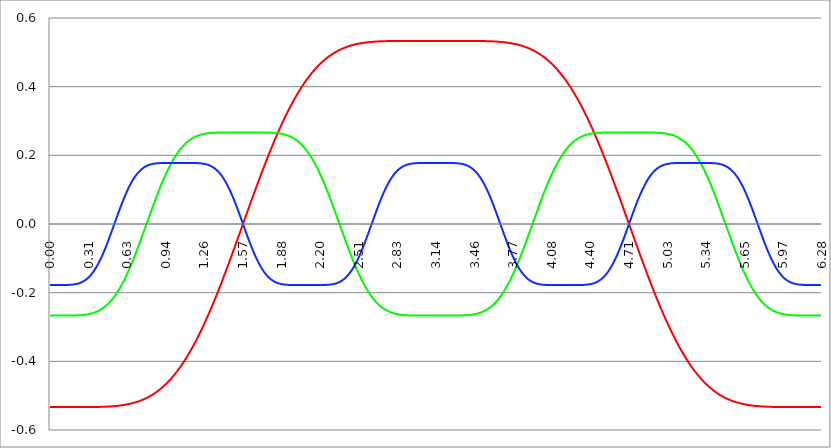
| Category | Series 1 | Series 0 | Series 2 |
|---|---|---|---|
| 0.0 | -0.533 | -0.267 | -0.178 |
| 0.00314159265358979 | -0.533 | -0.267 | -0.178 |
| 0.00628318530717958 | -0.533 | -0.267 | -0.178 |
| 0.00942477796076938 | -0.533 | -0.267 | -0.178 |
| 0.0125663706143592 | -0.533 | -0.267 | -0.178 |
| 0.015707963267949 | -0.533 | -0.267 | -0.178 |
| 0.0188495559215388 | -0.533 | -0.267 | -0.178 |
| 0.0219911485751285 | -0.533 | -0.267 | -0.178 |
| 0.0251327412287183 | -0.533 | -0.267 | -0.178 |
| 0.0282743338823081 | -0.533 | -0.267 | -0.178 |
| 0.0314159265358979 | -0.533 | -0.267 | -0.178 |
| 0.0345575191894877 | -0.533 | -0.267 | -0.178 |
| 0.0376991118430775 | -0.533 | -0.267 | -0.178 |
| 0.0408407044966673 | -0.533 | -0.267 | -0.178 |
| 0.0439822971502571 | -0.533 | -0.267 | -0.178 |
| 0.0471238898038469 | -0.533 | -0.267 | -0.178 |
| 0.0502654824574367 | -0.533 | -0.267 | -0.178 |
| 0.0534070751110265 | -0.533 | -0.267 | -0.178 |
| 0.0565486677646163 | -0.533 | -0.267 | -0.178 |
| 0.059690260418206 | -0.533 | -0.267 | -0.178 |
| 0.0628318530717958 | -0.533 | -0.267 | -0.178 |
| 0.0659734457253856 | -0.533 | -0.267 | -0.178 |
| 0.0691150383789754 | -0.533 | -0.267 | -0.178 |
| 0.0722566310325652 | -0.533 | -0.267 | -0.178 |
| 0.075398223686155 | -0.533 | -0.267 | -0.178 |
| 0.0785398163397448 | -0.533 | -0.267 | -0.178 |
| 0.0816814089933346 | -0.533 | -0.267 | -0.178 |
| 0.0848230016469244 | -0.533 | -0.267 | -0.178 |
| 0.0879645943005142 | -0.533 | -0.267 | -0.178 |
| 0.091106186954104 | -0.533 | -0.267 | -0.178 |
| 0.0942477796076937 | -0.533 | -0.267 | -0.178 |
| 0.0973893722612835 | -0.533 | -0.267 | -0.178 |
| 0.100530964914873 | -0.533 | -0.267 | -0.178 |
| 0.103672557568463 | -0.533 | -0.267 | -0.178 |
| 0.106814150222053 | -0.533 | -0.267 | -0.178 |
| 0.109955742875643 | -0.533 | -0.267 | -0.178 |
| 0.113097335529233 | -0.533 | -0.267 | -0.178 |
| 0.116238928182822 | -0.533 | -0.267 | -0.178 |
| 0.119380520836412 | -0.533 | -0.267 | -0.178 |
| 0.122522113490002 | -0.533 | -0.267 | -0.178 |
| 0.125663706143592 | -0.533 | -0.267 | -0.178 |
| 0.128805298797181 | -0.533 | -0.267 | -0.178 |
| 0.131946891450771 | -0.533 | -0.267 | -0.178 |
| 0.135088484104361 | -0.533 | -0.267 | -0.178 |
| 0.138230076757951 | -0.533 | -0.267 | -0.178 |
| 0.141371669411541 | -0.533 | -0.267 | -0.177 |
| 0.14451326206513 | -0.533 | -0.267 | -0.177 |
| 0.14765485471872 | -0.533 | -0.267 | -0.177 |
| 0.15079644737231 | -0.533 | -0.267 | -0.177 |
| 0.1539380400259 | -0.533 | -0.267 | -0.177 |
| 0.15707963267949 | -0.533 | -0.267 | -0.177 |
| 0.160221225333079 | -0.533 | -0.267 | -0.177 |
| 0.163362817986669 | -0.533 | -0.267 | -0.177 |
| 0.166504410640259 | -0.533 | -0.267 | -0.177 |
| 0.169646003293849 | -0.533 | -0.267 | -0.177 |
| 0.172787595947439 | -0.533 | -0.267 | -0.177 |
| 0.175929188601028 | -0.533 | -0.267 | -0.177 |
| 0.179070781254618 | -0.533 | -0.267 | -0.177 |
| 0.182212373908208 | -0.533 | -0.266 | -0.177 |
| 0.185353966561798 | -0.533 | -0.266 | -0.176 |
| 0.188495559215388 | -0.533 | -0.266 | -0.176 |
| 0.191637151868977 | -0.533 | -0.266 | -0.176 |
| 0.194778744522567 | -0.533 | -0.266 | -0.176 |
| 0.197920337176157 | -0.533 | -0.266 | -0.176 |
| 0.201061929829747 | -0.533 | -0.266 | -0.176 |
| 0.204203522483336 | -0.533 | -0.266 | -0.175 |
| 0.207345115136926 | -0.533 | -0.266 | -0.175 |
| 0.210486707790516 | -0.533 | -0.266 | -0.175 |
| 0.213628300444106 | -0.533 | -0.266 | -0.175 |
| 0.216769893097696 | -0.533 | -0.266 | -0.175 |
| 0.219911485751285 | -0.533 | -0.266 | -0.174 |
| 0.223053078404875 | -0.533 | -0.266 | -0.174 |
| 0.226194671058465 | -0.533 | -0.266 | -0.174 |
| 0.229336263712055 | -0.533 | -0.266 | -0.173 |
| 0.232477856365645 | -0.533 | -0.266 | -0.173 |
| 0.235619449019234 | -0.533 | -0.266 | -0.173 |
| 0.238761041672824 | -0.533 | -0.266 | -0.172 |
| 0.241902634326414 | -0.533 | -0.266 | -0.172 |
| 0.245044226980004 | -0.533 | -0.266 | -0.172 |
| 0.248185819633594 | -0.533 | -0.266 | -0.171 |
| 0.251327412287183 | -0.533 | -0.266 | -0.171 |
| 0.254469004940773 | -0.533 | -0.265 | -0.17 |
| 0.257610597594363 | -0.533 | -0.265 | -0.17 |
| 0.260752190247953 | -0.533 | -0.265 | -0.169 |
| 0.263893782901543 | -0.533 | -0.265 | -0.169 |
| 0.267035375555132 | -0.533 | -0.265 | -0.168 |
| 0.270176968208722 | -0.533 | -0.265 | -0.167 |
| 0.273318560862312 | -0.533 | -0.265 | -0.167 |
| 0.276460153515902 | -0.533 | -0.265 | -0.166 |
| 0.279601746169492 | -0.533 | -0.265 | -0.165 |
| 0.282743338823082 | -0.533 | -0.264 | -0.165 |
| 0.285884931476671 | -0.533 | -0.264 | -0.164 |
| 0.289026524130261 | -0.533 | -0.264 | -0.163 |
| 0.292168116783851 | -0.533 | -0.264 | -0.162 |
| 0.295309709437441 | -0.533 | -0.264 | -0.161 |
| 0.298451302091031 | -0.533 | -0.264 | -0.16 |
| 0.30159289474462 | -0.533 | -0.263 | -0.16 |
| 0.30473448739821 | -0.533 | -0.263 | -0.159 |
| 0.3078760800518 | -0.533 | -0.263 | -0.158 |
| 0.31101767270539 | -0.533 | -0.263 | -0.157 |
| 0.31415926535898 | -0.533 | -0.263 | -0.155 |
| 0.31730085801257 | -0.533 | -0.262 | -0.154 |
| 0.320442450666159 | -0.533 | -0.262 | -0.153 |
| 0.323584043319749 | -0.533 | -0.262 | -0.152 |
| 0.326725635973339 | -0.533 | -0.262 | -0.151 |
| 0.329867228626929 | -0.533 | -0.261 | -0.15 |
| 0.333008821280519 | -0.533 | -0.261 | -0.148 |
| 0.336150413934108 | -0.533 | -0.261 | -0.147 |
| 0.339292006587698 | -0.533 | -0.261 | -0.146 |
| 0.342433599241288 | -0.533 | -0.26 | -0.144 |
| 0.345575191894878 | -0.533 | -0.26 | -0.143 |
| 0.348716784548468 | -0.533 | -0.26 | -0.141 |
| 0.351858377202058 | -0.533 | -0.259 | -0.14 |
| 0.354999969855647 | -0.533 | -0.259 | -0.138 |
| 0.358141562509237 | -0.533 | -0.259 | -0.136 |
| 0.361283155162827 | -0.533 | -0.258 | -0.135 |
| 0.364424747816417 | -0.533 | -0.258 | -0.133 |
| 0.367566340470007 | -0.533 | -0.257 | -0.131 |
| 0.370707933123597 | -0.533 | -0.257 | -0.129 |
| 0.373849525777186 | -0.533 | -0.256 | -0.128 |
| 0.376991118430776 | -0.533 | -0.256 | -0.126 |
| 0.380132711084366 | -0.533 | -0.255 | -0.124 |
| 0.383274303737956 | -0.533 | -0.255 | -0.122 |
| 0.386415896391546 | -0.533 | -0.254 | -0.12 |
| 0.389557489045135 | -0.533 | -0.254 | -0.118 |
| 0.392699081698725 | -0.533 | -0.253 | -0.116 |
| 0.395840674352315 | -0.533 | -0.253 | -0.114 |
| 0.398982267005905 | -0.533 | -0.252 | -0.111 |
| 0.402123859659495 | -0.533 | -0.252 | -0.109 |
| 0.405265452313085 | -0.533 | -0.251 | -0.107 |
| 0.408407044966674 | -0.533 | -0.25 | -0.105 |
| 0.411548637620264 | -0.533 | -0.25 | -0.102 |
| 0.414690230273854 | -0.533 | -0.249 | -0.1 |
| 0.417831822927444 | -0.533 | -0.248 | -0.097 |
| 0.420973415581034 | -0.533 | -0.248 | -0.095 |
| 0.424115008234623 | -0.532 | -0.247 | -0.093 |
| 0.427256600888213 | -0.532 | -0.246 | -0.09 |
| 0.430398193541803 | -0.532 | -0.245 | -0.087 |
| 0.433539786195393 | -0.532 | -0.245 | -0.085 |
| 0.436681378848983 | -0.532 | -0.244 | -0.082 |
| 0.439822971502573 | -0.532 | -0.243 | -0.08 |
| 0.442964564156162 | -0.532 | -0.242 | -0.077 |
| 0.446106156809752 | -0.532 | -0.241 | -0.074 |
| 0.449247749463342 | -0.532 | -0.24 | -0.071 |
| 0.452389342116932 | -0.532 | -0.239 | -0.069 |
| 0.455530934770522 | -0.532 | -0.238 | -0.066 |
| 0.458672527424111 | -0.532 | -0.237 | -0.063 |
| 0.461814120077701 | -0.532 | -0.236 | -0.06 |
| 0.464955712731291 | -0.532 | -0.235 | -0.057 |
| 0.468097305384881 | -0.532 | -0.234 | -0.054 |
| 0.471238898038471 | -0.532 | -0.233 | -0.051 |
| 0.474380490692061 | -0.532 | -0.232 | -0.048 |
| 0.47752208334565 | -0.532 | -0.231 | -0.045 |
| 0.48066367599924 | -0.532 | -0.23 | -0.042 |
| 0.48380526865283 | -0.531 | -0.229 | -0.039 |
| 0.48694686130642 | -0.531 | -0.227 | -0.036 |
| 0.49008845396001 | -0.531 | -0.226 | -0.033 |
| 0.493230046613599 | -0.531 | -0.225 | -0.03 |
| 0.496371639267189 | -0.531 | -0.224 | -0.027 |
| 0.499513231920779 | -0.531 | -0.222 | -0.024 |
| 0.502654824574369 | -0.531 | -0.221 | -0.021 |
| 0.505796417227959 | -0.531 | -0.22 | -0.018 |
| 0.508938009881549 | -0.531 | -0.218 | -0.015 |
| 0.512079602535138 | -0.531 | -0.217 | -0.012 |
| 0.515221195188728 | -0.531 | -0.215 | -0.008 |
| 0.518362787842318 | -0.531 | -0.214 | -0.005 |
| 0.521504380495908 | -0.531 | -0.212 | -0.002 |
| 0.524645973149498 | -0.53 | -0.211 | 0.001 |
| 0.527787565803087 | -0.53 | -0.209 | 0.004 |
| 0.530929158456677 | -0.53 | -0.208 | 0.007 |
| 0.534070751110267 | -0.53 | -0.206 | 0.01 |
| 0.537212343763857 | -0.53 | -0.205 | 0.014 |
| 0.540353936417447 | -0.53 | -0.203 | 0.017 |
| 0.543495529071037 | -0.53 | -0.201 | 0.02 |
| 0.546637121724626 | -0.53 | -0.199 | 0.023 |
| 0.549778714378216 | -0.53 | -0.198 | 0.026 |
| 0.552920307031806 | -0.529 | -0.196 | 0.029 |
| 0.556061899685396 | -0.529 | -0.194 | 0.032 |
| 0.559203492338986 | -0.529 | -0.192 | 0.035 |
| 0.562345084992576 | -0.529 | -0.19 | 0.038 |
| 0.565486677646165 | -0.529 | -0.189 | 0.041 |
| 0.568628270299755 | -0.529 | -0.187 | 0.044 |
| 0.571769862953345 | -0.529 | -0.185 | 0.047 |
| 0.574911455606935 | -0.528 | -0.183 | 0.05 |
| 0.578053048260525 | -0.528 | -0.181 | 0.053 |
| 0.581194640914114 | -0.528 | -0.179 | 0.056 |
| 0.584336233567704 | -0.528 | -0.177 | 0.059 |
| 0.587477826221294 | -0.528 | -0.175 | 0.062 |
| 0.590619418874884 | -0.528 | -0.172 | 0.065 |
| 0.593761011528474 | -0.527 | -0.17 | 0.068 |
| 0.596902604182064 | -0.527 | -0.168 | 0.07 |
| 0.600044196835653 | -0.527 | -0.166 | 0.073 |
| 0.603185789489243 | -0.527 | -0.164 | 0.076 |
| 0.606327382142833 | -0.527 | -0.161 | 0.079 |
| 0.609468974796423 | -0.527 | -0.159 | 0.081 |
| 0.612610567450013 | -0.526 | -0.157 | 0.084 |
| 0.615752160103602 | -0.526 | -0.155 | 0.087 |
| 0.618893752757192 | -0.526 | -0.152 | 0.089 |
| 0.622035345410782 | -0.526 | -0.15 | 0.092 |
| 0.625176938064372 | -0.526 | -0.147 | 0.094 |
| 0.628318530717962 | -0.525 | -0.145 | 0.097 |
| 0.631460123371551 | -0.525 | -0.142 | 0.099 |
| 0.634601716025141 | -0.525 | -0.14 | 0.101 |
| 0.637743308678731 | -0.525 | -0.138 | 0.104 |
| 0.640884901332321 | -0.524 | -0.135 | 0.106 |
| 0.644026493985911 | -0.524 | -0.132 | 0.108 |
| 0.647168086639501 | -0.524 | -0.13 | 0.111 |
| 0.65030967929309 | -0.524 | -0.127 | 0.113 |
| 0.65345127194668 | -0.523 | -0.125 | 0.115 |
| 0.65659286460027 | -0.523 | -0.122 | 0.117 |
| 0.65973445725386 | -0.523 | -0.119 | 0.119 |
| 0.66287604990745 | -0.523 | -0.117 | 0.121 |
| 0.666017642561039 | -0.522 | -0.114 | 0.123 |
| 0.669159235214629 | -0.522 | -0.111 | 0.125 |
| 0.672300827868219 | -0.522 | -0.108 | 0.127 |
| 0.675442420521809 | -0.521 | -0.106 | 0.129 |
| 0.678584013175399 | -0.521 | -0.103 | 0.131 |
| 0.681725605828989 | -0.521 | -0.1 | 0.132 |
| 0.684867198482578 | -0.521 | -0.097 | 0.134 |
| 0.688008791136168 | -0.52 | -0.094 | 0.136 |
| 0.691150383789758 | -0.52 | -0.092 | 0.137 |
| 0.694291976443348 | -0.52 | -0.089 | 0.139 |
| 0.697433569096938 | -0.519 | -0.086 | 0.141 |
| 0.700575161750528 | -0.519 | -0.083 | 0.142 |
| 0.703716754404117 | -0.518 | -0.08 | 0.144 |
| 0.706858347057707 | -0.518 | -0.077 | 0.145 |
| 0.709999939711297 | -0.518 | -0.074 | 0.146 |
| 0.713141532364887 | -0.517 | -0.071 | 0.148 |
| 0.716283125018477 | -0.517 | -0.068 | 0.149 |
| 0.719424717672066 | -0.517 | -0.065 | 0.15 |
| 0.722566310325656 | -0.516 | -0.062 | 0.152 |
| 0.725707902979246 | -0.516 | -0.059 | 0.153 |
| 0.728849495632836 | -0.515 | -0.056 | 0.154 |
| 0.731991088286426 | -0.515 | -0.053 | 0.155 |
| 0.735132680940016 | -0.515 | -0.05 | 0.156 |
| 0.738274273593605 | -0.514 | -0.047 | 0.157 |
| 0.741415866247195 | -0.514 | -0.044 | 0.158 |
| 0.744557458900785 | -0.513 | -0.041 | 0.159 |
| 0.747699051554375 | -0.513 | -0.038 | 0.16 |
| 0.750840644207965 | -0.512 | -0.034 | 0.161 |
| 0.753982236861554 | -0.512 | -0.031 | 0.162 |
| 0.757123829515144 | -0.511 | -0.028 | 0.163 |
| 0.760265422168734 | -0.511 | -0.025 | 0.164 |
| 0.763407014822324 | -0.51 | -0.022 | 0.164 |
| 0.766548607475914 | -0.51 | -0.019 | 0.165 |
| 0.769690200129504 | -0.509 | -0.016 | 0.166 |
| 0.772831792783093 | -0.509 | -0.013 | 0.166 |
| 0.775973385436683 | -0.508 | -0.009 | 0.167 |
| 0.779114978090273 | -0.508 | -0.006 | 0.168 |
| 0.782256570743863 | -0.507 | -0.003 | 0.168 |
| 0.785398163397453 | -0.507 | 0 | 0.169 |
| 0.788539756051042 | -0.506 | 0.003 | 0.169 |
| 0.791681348704632 | -0.506 | 0.006 | 0.17 |
| 0.794822941358222 | -0.505 | 0.009 | 0.17 |
| 0.797964534011812 | -0.504 | 0.013 | 0.171 |
| 0.801106126665402 | -0.504 | 0.016 | 0.171 |
| 0.804247719318992 | -0.503 | 0.019 | 0.172 |
| 0.807389311972581 | -0.503 | 0.022 | 0.172 |
| 0.810530904626171 | -0.502 | 0.025 | 0.173 |
| 0.813672497279761 | -0.501 | 0.028 | 0.173 |
| 0.816814089933351 | -0.501 | 0.031 | 0.173 |
| 0.819955682586941 | -0.5 | 0.034 | 0.174 |
| 0.823097275240531 | -0.499 | 0.038 | 0.174 |
| 0.82623886789412 | -0.499 | 0.041 | 0.174 |
| 0.82938046054771 | -0.498 | 0.044 | 0.174 |
| 0.8325220532013 | -0.497 | 0.047 | 0.175 |
| 0.83566364585489 | -0.497 | 0.05 | 0.175 |
| 0.83880523850848 | -0.496 | 0.053 | 0.175 |
| 0.841946831162069 | -0.495 | 0.056 | 0.175 |
| 0.845088423815659 | -0.495 | 0.059 | 0.176 |
| 0.848230016469249 | -0.494 | 0.062 | 0.176 |
| 0.851371609122839 | -0.493 | 0.065 | 0.176 |
| 0.854513201776429 | -0.492 | 0.068 | 0.176 |
| 0.857654794430019 | -0.492 | 0.071 | 0.176 |
| 0.860796387083608 | -0.491 | 0.074 | 0.176 |
| 0.863937979737198 | -0.49 | 0.077 | 0.177 |
| 0.867079572390788 | -0.489 | 0.08 | 0.177 |
| 0.870221165044378 | -0.488 | 0.083 | 0.177 |
| 0.873362757697968 | -0.487 | 0.086 | 0.177 |
| 0.876504350351557 | -0.487 | 0.089 | 0.177 |
| 0.879645943005147 | -0.486 | 0.092 | 0.177 |
| 0.882787535658737 | -0.485 | 0.094 | 0.177 |
| 0.885929128312327 | -0.484 | 0.097 | 0.177 |
| 0.889070720965917 | -0.483 | 0.1 | 0.177 |
| 0.892212313619507 | -0.482 | 0.103 | 0.177 |
| 0.895353906273096 | -0.481 | 0.106 | 0.177 |
| 0.898495498926686 | -0.48 | 0.108 | 0.177 |
| 0.901637091580276 | -0.48 | 0.111 | 0.177 |
| 0.904778684233866 | -0.479 | 0.114 | 0.177 |
| 0.907920276887456 | -0.478 | 0.117 | 0.178 |
| 0.911061869541045 | -0.477 | 0.119 | 0.178 |
| 0.914203462194635 | -0.476 | 0.122 | 0.178 |
| 0.917345054848225 | -0.475 | 0.125 | 0.178 |
| 0.920486647501815 | -0.474 | 0.127 | 0.178 |
| 0.923628240155405 | -0.473 | 0.13 | 0.178 |
| 0.926769832808995 | -0.472 | 0.132 | 0.178 |
| 0.929911425462584 | -0.471 | 0.135 | 0.178 |
| 0.933053018116174 | -0.47 | 0.138 | 0.178 |
| 0.936194610769764 | -0.469 | 0.14 | 0.178 |
| 0.939336203423354 | -0.468 | 0.142 | 0.178 |
| 0.942477796076944 | -0.466 | 0.145 | 0.178 |
| 0.945619388730533 | -0.465 | 0.147 | 0.178 |
| 0.948760981384123 | -0.464 | 0.15 | 0.178 |
| 0.951902574037713 | -0.463 | 0.152 | 0.178 |
| 0.955044166691303 | -0.462 | 0.155 | 0.178 |
| 0.958185759344893 | -0.461 | 0.157 | 0.178 |
| 0.961327351998483 | -0.46 | 0.159 | 0.178 |
| 0.964468944652072 | -0.459 | 0.161 | 0.178 |
| 0.967610537305662 | -0.457 | 0.164 | 0.178 |
| 0.970752129959252 | -0.456 | 0.166 | 0.178 |
| 0.973893722612842 | -0.455 | 0.168 | 0.178 |
| 0.977035315266432 | -0.454 | 0.17 | 0.178 |
| 0.980176907920022 | -0.452 | 0.172 | 0.178 |
| 0.983318500573611 | -0.451 | 0.175 | 0.178 |
| 0.986460093227201 | -0.45 | 0.177 | 0.178 |
| 0.989601685880791 | -0.449 | 0.179 | 0.178 |
| 0.992743278534381 | -0.447 | 0.181 | 0.178 |
| 0.995884871187971 | -0.446 | 0.183 | 0.178 |
| 0.99902646384156 | -0.445 | 0.185 | 0.178 |
| 1.00216805649515 | -0.443 | 0.187 | 0.178 |
| 1.00530964914874 | -0.442 | 0.189 | 0.178 |
| 1.00845124180233 | -0.441 | 0.19 | 0.178 |
| 1.01159283445592 | -0.439 | 0.192 | 0.178 |
| 1.01473442710951 | -0.438 | 0.194 | 0.178 |
| 1.017876019763099 | -0.437 | 0.196 | 0.178 |
| 1.021017612416689 | -0.435 | 0.198 | 0.178 |
| 1.02415920507028 | -0.434 | 0.199 | 0.178 |
| 1.027300797723869 | -0.432 | 0.201 | 0.178 |
| 1.030442390377459 | -0.431 | 0.203 | 0.178 |
| 1.033583983031048 | -0.429 | 0.205 | 0.178 |
| 1.036725575684638 | -0.428 | 0.206 | 0.178 |
| 1.039867168338228 | -0.426 | 0.208 | 0.178 |
| 1.043008760991818 | -0.425 | 0.209 | 0.178 |
| 1.046150353645408 | -0.423 | 0.211 | 0.178 |
| 1.049291946298998 | -0.422 | 0.212 | 0.178 |
| 1.052433538952587 | -0.42 | 0.214 | 0.178 |
| 1.055575131606177 | -0.419 | 0.215 | 0.178 |
| 1.058716724259767 | -0.417 | 0.217 | 0.178 |
| 1.061858316913357 | -0.416 | 0.218 | 0.178 |
| 1.064999909566947 | -0.414 | 0.22 | 0.178 |
| 1.068141502220536 | -0.412 | 0.221 | 0.178 |
| 1.071283094874126 | -0.411 | 0.222 | 0.178 |
| 1.074424687527716 | -0.409 | 0.224 | 0.178 |
| 1.077566280181306 | -0.407 | 0.225 | 0.178 |
| 1.080707872834896 | -0.406 | 0.226 | 0.178 |
| 1.083849465488486 | -0.404 | 0.227 | 0.178 |
| 1.086991058142075 | -0.402 | 0.229 | 0.178 |
| 1.090132650795665 | -0.401 | 0.23 | 0.178 |
| 1.093274243449255 | -0.399 | 0.231 | 0.178 |
| 1.096415836102845 | -0.397 | 0.232 | 0.178 |
| 1.099557428756435 | -0.395 | 0.233 | 0.178 |
| 1.102699021410025 | -0.394 | 0.234 | 0.178 |
| 1.105840614063614 | -0.392 | 0.235 | 0.178 |
| 1.108982206717204 | -0.39 | 0.236 | 0.178 |
| 1.112123799370794 | -0.388 | 0.237 | 0.178 |
| 1.115265392024384 | -0.386 | 0.238 | 0.178 |
| 1.118406984677974 | -0.385 | 0.239 | 0.178 |
| 1.121548577331563 | -0.383 | 0.24 | 0.178 |
| 1.124690169985153 | -0.381 | 0.241 | 0.178 |
| 1.127831762638743 | -0.379 | 0.242 | 0.178 |
| 1.130973355292333 | -0.377 | 0.243 | 0.178 |
| 1.134114947945923 | -0.375 | 0.244 | 0.178 |
| 1.137256540599513 | -0.373 | 0.245 | 0.178 |
| 1.140398133253102 | -0.371 | 0.245 | 0.178 |
| 1.143539725906692 | -0.369 | 0.246 | 0.178 |
| 1.146681318560282 | -0.367 | 0.247 | 0.178 |
| 1.149822911213872 | -0.365 | 0.248 | 0.178 |
| 1.152964503867462 | -0.363 | 0.248 | 0.178 |
| 1.156106096521051 | -0.361 | 0.249 | 0.178 |
| 1.159247689174641 | -0.359 | 0.25 | 0.178 |
| 1.162389281828231 | -0.357 | 0.25 | 0.178 |
| 1.165530874481821 | -0.355 | 0.251 | 0.178 |
| 1.168672467135411 | -0.353 | 0.252 | 0.178 |
| 1.171814059789001 | -0.351 | 0.252 | 0.178 |
| 1.17495565244259 | -0.349 | 0.253 | 0.178 |
| 1.17809724509618 | -0.347 | 0.253 | 0.178 |
| 1.18123883774977 | -0.345 | 0.254 | 0.178 |
| 1.18438043040336 | -0.343 | 0.254 | 0.178 |
| 1.18752202305695 | -0.341 | 0.255 | 0.178 |
| 1.190663615710539 | -0.338 | 0.255 | 0.177 |
| 1.193805208364129 | -0.336 | 0.256 | 0.177 |
| 1.19694680101772 | -0.334 | 0.256 | 0.177 |
| 1.200088393671309 | -0.332 | 0.257 | 0.177 |
| 1.203229986324899 | -0.33 | 0.257 | 0.177 |
| 1.206371578978489 | -0.327 | 0.258 | 0.177 |
| 1.209513171632078 | -0.325 | 0.258 | 0.177 |
| 1.212654764285668 | -0.323 | 0.259 | 0.177 |
| 1.215796356939258 | -0.321 | 0.259 | 0.177 |
| 1.218937949592848 | -0.318 | 0.259 | 0.177 |
| 1.222079542246438 | -0.316 | 0.26 | 0.177 |
| 1.225221134900027 | -0.314 | 0.26 | 0.177 |
| 1.228362727553617 | -0.311 | 0.26 | 0.177 |
| 1.231504320207207 | -0.309 | 0.261 | 0.176 |
| 1.234645912860797 | -0.307 | 0.261 | 0.176 |
| 1.237787505514387 | -0.304 | 0.261 | 0.176 |
| 1.240929098167977 | -0.302 | 0.261 | 0.176 |
| 1.244070690821566 | -0.3 | 0.262 | 0.176 |
| 1.247212283475156 | -0.297 | 0.262 | 0.176 |
| 1.250353876128746 | -0.295 | 0.262 | 0.176 |
| 1.253495468782336 | -0.292 | 0.262 | 0.175 |
| 1.256637061435926 | -0.29 | 0.263 | 0.175 |
| 1.259778654089515 | -0.287 | 0.263 | 0.175 |
| 1.262920246743105 | -0.285 | 0.263 | 0.175 |
| 1.266061839396695 | -0.283 | 0.263 | 0.174 |
| 1.269203432050285 | -0.28 | 0.263 | 0.174 |
| 1.272345024703875 | -0.278 | 0.264 | 0.174 |
| 1.275486617357465 | -0.275 | 0.264 | 0.174 |
| 1.278628210011054 | -0.272 | 0.264 | 0.173 |
| 1.281769802664644 | -0.27 | 0.264 | 0.173 |
| 1.284911395318234 | -0.267 | 0.264 | 0.172 |
| 1.288052987971824 | -0.265 | 0.264 | 0.172 |
| 1.291194580625414 | -0.262 | 0.265 | 0.172 |
| 1.294336173279003 | -0.26 | 0.265 | 0.171 |
| 1.297477765932593 | -0.257 | 0.265 | 0.171 |
| 1.300619358586183 | -0.254 | 0.265 | 0.17 |
| 1.303760951239773 | -0.252 | 0.265 | 0.17 |
| 1.306902543893363 | -0.249 | 0.265 | 0.169 |
| 1.310044136546953 | -0.247 | 0.265 | 0.169 |
| 1.313185729200542 | -0.244 | 0.265 | 0.168 |
| 1.316327321854132 | -0.241 | 0.265 | 0.168 |
| 1.319468914507722 | -0.239 | 0.266 | 0.167 |
| 1.322610507161312 | -0.236 | 0.266 | 0.166 |
| 1.325752099814902 | -0.233 | 0.266 | 0.166 |
| 1.328893692468491 | -0.231 | 0.266 | 0.165 |
| 1.332035285122081 | -0.228 | 0.266 | 0.164 |
| 1.335176877775671 | -0.225 | 0.266 | 0.163 |
| 1.338318470429261 | -0.222 | 0.266 | 0.162 |
| 1.341460063082851 | -0.22 | 0.266 | 0.162 |
| 1.344601655736441 | -0.217 | 0.266 | 0.161 |
| 1.34774324839003 | -0.214 | 0.266 | 0.16 |
| 1.35088484104362 | -0.211 | 0.266 | 0.159 |
| 1.35402643369721 | -0.209 | 0.266 | 0.158 |
| 1.3571680263508 | -0.206 | 0.266 | 0.157 |
| 1.36030961900439 | -0.203 | 0.266 | 0.156 |
| 1.363451211657979 | -0.2 | 0.266 | 0.155 |
| 1.36659280431157 | -0.197 | 0.266 | 0.154 |
| 1.369734396965159 | -0.194 | 0.266 | 0.152 |
| 1.372875989618749 | -0.192 | 0.266 | 0.151 |
| 1.376017582272339 | -0.189 | 0.266 | 0.15 |
| 1.379159174925929 | -0.186 | 0.266 | 0.149 |
| 1.382300767579518 | -0.183 | 0.266 | 0.147 |
| 1.385442360233108 | -0.18 | 0.266 | 0.146 |
| 1.388583952886698 | -0.177 | 0.266 | 0.145 |
| 1.391725545540288 | -0.174 | 0.267 | 0.143 |
| 1.394867138193878 | -0.171 | 0.267 | 0.142 |
| 1.398008730847468 | -0.169 | 0.267 | 0.14 |
| 1.401150323501057 | -0.166 | 0.267 | 0.139 |
| 1.404291916154647 | -0.163 | 0.267 | 0.137 |
| 1.407433508808237 | -0.16 | 0.267 | 0.135 |
| 1.410575101461827 | -0.157 | 0.267 | 0.134 |
| 1.413716694115417 | -0.154 | 0.267 | 0.132 |
| 1.416858286769006 | -0.151 | 0.267 | 0.13 |
| 1.419999879422596 | -0.148 | 0.267 | 0.128 |
| 1.423141472076186 | -0.145 | 0.267 | 0.126 |
| 1.426283064729776 | -0.142 | 0.267 | 0.124 |
| 1.429424657383366 | -0.139 | 0.267 | 0.122 |
| 1.432566250036956 | -0.136 | 0.267 | 0.12 |
| 1.435707842690545 | -0.133 | 0.267 | 0.118 |
| 1.438849435344135 | -0.13 | 0.267 | 0.116 |
| 1.441991027997725 | -0.127 | 0.267 | 0.114 |
| 1.445132620651315 | -0.124 | 0.267 | 0.112 |
| 1.448274213304905 | -0.121 | 0.267 | 0.11 |
| 1.451415805958494 | -0.118 | 0.267 | 0.108 |
| 1.454557398612084 | -0.115 | 0.267 | 0.105 |
| 1.457698991265674 | -0.112 | 0.267 | 0.103 |
| 1.460840583919264 | -0.109 | 0.267 | 0.101 |
| 1.463982176572854 | -0.106 | 0.267 | 0.098 |
| 1.467123769226444 | -0.103 | 0.267 | 0.096 |
| 1.470265361880033 | -0.1 | 0.267 | 0.093 |
| 1.473406954533623 | -0.097 | 0.267 | 0.091 |
| 1.476548547187213 | -0.094 | 0.267 | 0.088 |
| 1.479690139840803 | -0.09 | 0.267 | 0.086 |
| 1.482831732494393 | -0.087 | 0.267 | 0.083 |
| 1.485973325147982 | -0.084 | 0.267 | 0.08 |
| 1.489114917801572 | -0.081 | 0.267 | 0.078 |
| 1.492256510455162 | -0.078 | 0.267 | 0.075 |
| 1.495398103108752 | -0.075 | 0.267 | 0.072 |
| 1.498539695762342 | -0.072 | 0.267 | 0.07 |
| 1.501681288415932 | -0.069 | 0.267 | 0.067 |
| 1.504822881069521 | -0.066 | 0.267 | 0.064 |
| 1.507964473723111 | -0.063 | 0.267 | 0.061 |
| 1.511106066376701 | -0.06 | 0.267 | 0.058 |
| 1.514247659030291 | -0.056 | 0.267 | 0.055 |
| 1.517389251683881 | -0.053 | 0.267 | 0.052 |
| 1.520530844337471 | -0.05 | 0.267 | 0.049 |
| 1.52367243699106 | -0.047 | 0.267 | 0.046 |
| 1.52681402964465 | -0.044 | 0.267 | 0.043 |
| 1.52995562229824 | -0.041 | 0.267 | 0.04 |
| 1.53309721495183 | -0.038 | 0.267 | 0.037 |
| 1.53623880760542 | -0.035 | 0.267 | 0.034 |
| 1.539380400259009 | -0.031 | 0.267 | 0.031 |
| 1.542521992912599 | -0.028 | 0.267 | 0.028 |
| 1.545663585566189 | -0.025 | 0.267 | 0.025 |
| 1.548805178219779 | -0.022 | 0.267 | 0.022 |
| 1.551946770873369 | -0.019 | 0.267 | 0.019 |
| 1.555088363526959 | -0.016 | 0.267 | 0.016 |
| 1.558229956180548 | -0.013 | 0.267 | 0.013 |
| 1.561371548834138 | -0.009 | 0.267 | 0.009 |
| 1.564513141487728 | -0.006 | 0.267 | 0.006 |
| 1.567654734141318 | -0.003 | 0.267 | 0.003 |
| 1.570796326794908 | 0 | 0.267 | 0 |
| 1.573937919448497 | 0.003 | 0.267 | -0.003 |
| 1.577079512102087 | 0.006 | 0.267 | -0.006 |
| 1.580221104755677 | 0.009 | 0.267 | -0.009 |
| 1.583362697409267 | 0.013 | 0.267 | -0.013 |
| 1.586504290062857 | 0.016 | 0.267 | -0.016 |
| 1.589645882716447 | 0.019 | 0.267 | -0.019 |
| 1.592787475370036 | 0.022 | 0.267 | -0.022 |
| 1.595929068023626 | 0.025 | 0.267 | -0.025 |
| 1.599070660677216 | 0.028 | 0.267 | -0.028 |
| 1.602212253330806 | 0.031 | 0.267 | -0.031 |
| 1.605353845984396 | 0.035 | 0.267 | -0.034 |
| 1.608495438637985 | 0.038 | 0.267 | -0.037 |
| 1.611637031291575 | 0.041 | 0.267 | -0.04 |
| 1.614778623945165 | 0.044 | 0.267 | -0.043 |
| 1.617920216598755 | 0.047 | 0.267 | -0.046 |
| 1.621061809252345 | 0.05 | 0.267 | -0.049 |
| 1.624203401905935 | 0.053 | 0.267 | -0.052 |
| 1.627344994559524 | 0.056 | 0.267 | -0.055 |
| 1.630486587213114 | 0.06 | 0.267 | -0.058 |
| 1.633628179866704 | 0.063 | 0.267 | -0.061 |
| 1.636769772520294 | 0.066 | 0.267 | -0.064 |
| 1.639911365173884 | 0.069 | 0.267 | -0.067 |
| 1.643052957827473 | 0.072 | 0.267 | -0.07 |
| 1.646194550481063 | 0.075 | 0.267 | -0.072 |
| 1.649336143134653 | 0.078 | 0.267 | -0.075 |
| 1.652477735788243 | 0.081 | 0.267 | -0.078 |
| 1.655619328441833 | 0.084 | 0.267 | -0.08 |
| 1.658760921095423 | 0.087 | 0.267 | -0.083 |
| 1.661902513749012 | 0.09 | 0.267 | -0.086 |
| 1.665044106402602 | 0.094 | 0.267 | -0.088 |
| 1.668185699056192 | 0.097 | 0.267 | -0.091 |
| 1.671327291709782 | 0.1 | 0.267 | -0.093 |
| 1.674468884363372 | 0.103 | 0.267 | -0.096 |
| 1.677610477016961 | 0.106 | 0.267 | -0.098 |
| 1.680752069670551 | 0.109 | 0.267 | -0.101 |
| 1.683893662324141 | 0.112 | 0.267 | -0.103 |
| 1.687035254977731 | 0.115 | 0.267 | -0.105 |
| 1.690176847631321 | 0.118 | 0.267 | -0.108 |
| 1.693318440284911 | 0.121 | 0.267 | -0.11 |
| 1.6964600329385 | 0.124 | 0.267 | -0.112 |
| 1.69960162559209 | 0.127 | 0.267 | -0.114 |
| 1.70274321824568 | 0.13 | 0.267 | -0.116 |
| 1.70588481089927 | 0.133 | 0.267 | -0.118 |
| 1.70902640355286 | 0.136 | 0.267 | -0.12 |
| 1.712167996206449 | 0.139 | 0.267 | -0.122 |
| 1.715309588860039 | 0.142 | 0.267 | -0.124 |
| 1.71845118151363 | 0.145 | 0.267 | -0.126 |
| 1.721592774167219 | 0.148 | 0.267 | -0.128 |
| 1.724734366820809 | 0.151 | 0.267 | -0.13 |
| 1.727875959474399 | 0.154 | 0.267 | -0.132 |
| 1.731017552127988 | 0.157 | 0.267 | -0.134 |
| 1.734159144781578 | 0.16 | 0.267 | -0.135 |
| 1.737300737435168 | 0.163 | 0.267 | -0.137 |
| 1.740442330088758 | 0.166 | 0.267 | -0.139 |
| 1.743583922742348 | 0.169 | 0.267 | -0.14 |
| 1.746725515395937 | 0.171 | 0.267 | -0.142 |
| 1.749867108049527 | 0.174 | 0.267 | -0.143 |
| 1.753008700703117 | 0.177 | 0.266 | -0.145 |
| 1.756150293356707 | 0.18 | 0.266 | -0.146 |
| 1.759291886010297 | 0.183 | 0.266 | -0.147 |
| 1.762433478663887 | 0.186 | 0.266 | -0.149 |
| 1.765575071317476 | 0.189 | 0.266 | -0.15 |
| 1.768716663971066 | 0.192 | 0.266 | -0.151 |
| 1.771858256624656 | 0.194 | 0.266 | -0.152 |
| 1.774999849278246 | 0.197 | 0.266 | -0.154 |
| 1.778141441931836 | 0.2 | 0.266 | -0.155 |
| 1.781283034585426 | 0.203 | 0.266 | -0.156 |
| 1.784424627239015 | 0.206 | 0.266 | -0.157 |
| 1.787566219892605 | 0.209 | 0.266 | -0.158 |
| 1.790707812546195 | 0.211 | 0.266 | -0.159 |
| 1.793849405199785 | 0.214 | 0.266 | -0.16 |
| 1.796990997853375 | 0.217 | 0.266 | -0.161 |
| 1.800132590506964 | 0.22 | 0.266 | -0.162 |
| 1.803274183160554 | 0.222 | 0.266 | -0.162 |
| 1.806415775814144 | 0.225 | 0.266 | -0.163 |
| 1.809557368467734 | 0.228 | 0.266 | -0.164 |
| 1.812698961121324 | 0.231 | 0.266 | -0.165 |
| 1.815840553774914 | 0.233 | 0.266 | -0.166 |
| 1.818982146428503 | 0.236 | 0.266 | -0.166 |
| 1.822123739082093 | 0.239 | 0.266 | -0.167 |
| 1.825265331735683 | 0.241 | 0.265 | -0.168 |
| 1.828406924389273 | 0.244 | 0.265 | -0.168 |
| 1.831548517042863 | 0.247 | 0.265 | -0.169 |
| 1.834690109696452 | 0.249 | 0.265 | -0.169 |
| 1.837831702350042 | 0.252 | 0.265 | -0.17 |
| 1.840973295003632 | 0.254 | 0.265 | -0.17 |
| 1.844114887657222 | 0.257 | 0.265 | -0.171 |
| 1.847256480310812 | 0.26 | 0.265 | -0.171 |
| 1.850398072964402 | 0.262 | 0.265 | -0.172 |
| 1.853539665617991 | 0.265 | 0.264 | -0.172 |
| 1.856681258271581 | 0.267 | 0.264 | -0.172 |
| 1.859822850925171 | 0.27 | 0.264 | -0.173 |
| 1.862964443578761 | 0.272 | 0.264 | -0.173 |
| 1.866106036232351 | 0.275 | 0.264 | -0.174 |
| 1.86924762888594 | 0.278 | 0.264 | -0.174 |
| 1.87238922153953 | 0.28 | 0.263 | -0.174 |
| 1.87553081419312 | 0.283 | 0.263 | -0.174 |
| 1.87867240684671 | 0.285 | 0.263 | -0.175 |
| 1.8818139995003 | 0.287 | 0.263 | -0.175 |
| 1.88495559215389 | 0.29 | 0.263 | -0.175 |
| 1.888097184807479 | 0.292 | 0.262 | -0.175 |
| 1.891238777461069 | 0.295 | 0.262 | -0.176 |
| 1.89438037011466 | 0.297 | 0.262 | -0.176 |
| 1.897521962768249 | 0.3 | 0.262 | -0.176 |
| 1.900663555421839 | 0.302 | 0.261 | -0.176 |
| 1.903805148075429 | 0.304 | 0.261 | -0.176 |
| 1.906946740729018 | 0.307 | 0.261 | -0.176 |
| 1.910088333382608 | 0.309 | 0.261 | -0.176 |
| 1.913229926036198 | 0.311 | 0.26 | -0.177 |
| 1.916371518689788 | 0.314 | 0.26 | -0.177 |
| 1.919513111343378 | 0.316 | 0.26 | -0.177 |
| 1.922654703996967 | 0.318 | 0.259 | -0.177 |
| 1.925796296650557 | 0.321 | 0.259 | -0.177 |
| 1.928937889304147 | 0.323 | 0.259 | -0.177 |
| 1.932079481957737 | 0.325 | 0.258 | -0.177 |
| 1.935221074611327 | 0.327 | 0.258 | -0.177 |
| 1.938362667264917 | 0.33 | 0.257 | -0.177 |
| 1.941504259918506 | 0.332 | 0.257 | -0.177 |
| 1.944645852572096 | 0.334 | 0.256 | -0.177 |
| 1.947787445225686 | 0.336 | 0.256 | -0.177 |
| 1.950929037879276 | 0.338 | 0.255 | -0.177 |
| 1.954070630532866 | 0.341 | 0.255 | -0.178 |
| 1.957212223186455 | 0.343 | 0.254 | -0.178 |
| 1.960353815840045 | 0.345 | 0.254 | -0.178 |
| 1.963495408493635 | 0.347 | 0.253 | -0.178 |
| 1.966637001147225 | 0.349 | 0.253 | -0.178 |
| 1.969778593800815 | 0.351 | 0.252 | -0.178 |
| 1.972920186454405 | 0.353 | 0.252 | -0.178 |
| 1.976061779107994 | 0.355 | 0.251 | -0.178 |
| 1.979203371761584 | 0.357 | 0.25 | -0.178 |
| 1.982344964415174 | 0.359 | 0.25 | -0.178 |
| 1.985486557068764 | 0.361 | 0.249 | -0.178 |
| 1.988628149722354 | 0.363 | 0.248 | -0.178 |
| 1.991769742375943 | 0.365 | 0.248 | -0.178 |
| 1.994911335029533 | 0.367 | 0.247 | -0.178 |
| 1.998052927683123 | 0.369 | 0.246 | -0.178 |
| 2.001194520336712 | 0.371 | 0.245 | -0.178 |
| 2.004336112990302 | 0.373 | 0.245 | -0.178 |
| 2.007477705643892 | 0.375 | 0.244 | -0.178 |
| 2.010619298297482 | 0.377 | 0.243 | -0.178 |
| 2.013760890951071 | 0.379 | 0.242 | -0.178 |
| 2.016902483604661 | 0.381 | 0.241 | -0.178 |
| 2.02004407625825 | 0.383 | 0.24 | -0.178 |
| 2.02318566891184 | 0.385 | 0.239 | -0.178 |
| 2.02632726156543 | 0.386 | 0.238 | -0.178 |
| 2.029468854219019 | 0.388 | 0.237 | -0.178 |
| 2.032610446872609 | 0.39 | 0.236 | -0.178 |
| 2.035752039526198 | 0.392 | 0.235 | -0.178 |
| 2.038893632179788 | 0.394 | 0.234 | -0.178 |
| 2.042035224833378 | 0.395 | 0.233 | -0.178 |
| 2.045176817486967 | 0.397 | 0.232 | -0.178 |
| 2.048318410140557 | 0.399 | 0.231 | -0.178 |
| 2.051460002794146 | 0.401 | 0.23 | -0.178 |
| 2.054601595447736 | 0.402 | 0.229 | -0.178 |
| 2.057743188101325 | 0.404 | 0.227 | -0.178 |
| 2.060884780754915 | 0.406 | 0.226 | -0.178 |
| 2.064026373408505 | 0.407 | 0.225 | -0.178 |
| 2.067167966062094 | 0.409 | 0.224 | -0.178 |
| 2.070309558715684 | 0.411 | 0.222 | -0.178 |
| 2.073451151369273 | 0.412 | 0.221 | -0.178 |
| 2.076592744022863 | 0.414 | 0.22 | -0.178 |
| 2.079734336676452 | 0.416 | 0.218 | -0.178 |
| 2.082875929330042 | 0.417 | 0.217 | -0.178 |
| 2.086017521983632 | 0.419 | 0.215 | -0.178 |
| 2.089159114637221 | 0.42 | 0.214 | -0.178 |
| 2.092300707290811 | 0.422 | 0.212 | -0.178 |
| 2.095442299944401 | 0.423 | 0.211 | -0.178 |
| 2.09858389259799 | 0.425 | 0.209 | -0.178 |
| 2.10172548525158 | 0.426 | 0.208 | -0.178 |
| 2.104867077905169 | 0.428 | 0.206 | -0.178 |
| 2.108008670558759 | 0.429 | 0.205 | -0.178 |
| 2.111150263212349 | 0.431 | 0.203 | -0.178 |
| 2.114291855865938 | 0.432 | 0.201 | -0.178 |
| 2.117433448519528 | 0.434 | 0.199 | -0.178 |
| 2.120575041173117 | 0.435 | 0.198 | -0.178 |
| 2.123716633826707 | 0.437 | 0.196 | -0.178 |
| 2.126858226480297 | 0.438 | 0.194 | -0.178 |
| 2.129999819133886 | 0.439 | 0.192 | -0.178 |
| 2.133141411787476 | 0.441 | 0.19 | -0.178 |
| 2.136283004441065 | 0.442 | 0.189 | -0.178 |
| 2.139424597094655 | 0.443 | 0.187 | -0.178 |
| 2.142566189748245 | 0.445 | 0.185 | -0.178 |
| 2.145707782401834 | 0.446 | 0.183 | -0.178 |
| 2.148849375055424 | 0.447 | 0.181 | -0.178 |
| 2.151990967709013 | 0.449 | 0.179 | -0.178 |
| 2.155132560362603 | 0.45 | 0.177 | -0.178 |
| 2.158274153016193 | 0.451 | 0.175 | -0.178 |
| 2.161415745669782 | 0.452 | 0.172 | -0.178 |
| 2.164557338323372 | 0.454 | 0.17 | -0.178 |
| 2.167698930976961 | 0.455 | 0.168 | -0.178 |
| 2.170840523630551 | 0.456 | 0.166 | -0.178 |
| 2.173982116284141 | 0.457 | 0.164 | -0.178 |
| 2.17712370893773 | 0.459 | 0.161 | -0.178 |
| 2.18026530159132 | 0.46 | 0.159 | -0.178 |
| 2.183406894244909 | 0.461 | 0.157 | -0.178 |
| 2.186548486898499 | 0.462 | 0.155 | -0.178 |
| 2.189690079552089 | 0.463 | 0.152 | -0.178 |
| 2.192831672205678 | 0.464 | 0.15 | -0.178 |
| 2.195973264859268 | 0.465 | 0.147 | -0.178 |
| 2.199114857512857 | 0.466 | 0.145 | -0.178 |
| 2.202256450166447 | 0.468 | 0.142 | -0.178 |
| 2.205398042820036 | 0.469 | 0.14 | -0.178 |
| 2.208539635473626 | 0.47 | 0.138 | -0.178 |
| 2.211681228127216 | 0.471 | 0.135 | -0.178 |
| 2.214822820780805 | 0.472 | 0.132 | -0.178 |
| 2.217964413434395 | 0.473 | 0.13 | -0.178 |
| 2.221106006087984 | 0.474 | 0.127 | -0.178 |
| 2.224247598741574 | 0.475 | 0.125 | -0.178 |
| 2.227389191395164 | 0.476 | 0.122 | -0.178 |
| 2.230530784048753 | 0.477 | 0.119 | -0.178 |
| 2.233672376702343 | 0.478 | 0.117 | -0.178 |
| 2.236813969355933 | 0.479 | 0.114 | -0.177 |
| 2.239955562009522 | 0.48 | 0.111 | -0.177 |
| 2.243097154663112 | 0.48 | 0.108 | -0.177 |
| 2.246238747316701 | 0.481 | 0.106 | -0.177 |
| 2.249380339970291 | 0.482 | 0.103 | -0.177 |
| 2.252521932623881 | 0.483 | 0.1 | -0.177 |
| 2.25566352527747 | 0.484 | 0.097 | -0.177 |
| 2.25880511793106 | 0.485 | 0.094 | -0.177 |
| 2.261946710584649 | 0.486 | 0.092 | -0.177 |
| 2.265088303238239 | 0.487 | 0.089 | -0.177 |
| 2.268229895891829 | 0.487 | 0.086 | -0.177 |
| 2.271371488545418 | 0.488 | 0.083 | -0.177 |
| 2.274513081199008 | 0.489 | 0.08 | -0.177 |
| 2.277654673852597 | 0.49 | 0.077 | -0.177 |
| 2.280796266506186 | 0.491 | 0.074 | -0.176 |
| 2.283937859159776 | 0.492 | 0.071 | -0.176 |
| 2.287079451813366 | 0.492 | 0.068 | -0.176 |
| 2.290221044466955 | 0.493 | 0.065 | -0.176 |
| 2.293362637120545 | 0.494 | 0.062 | -0.176 |
| 2.296504229774135 | 0.495 | 0.059 | -0.176 |
| 2.299645822427724 | 0.495 | 0.056 | -0.175 |
| 2.302787415081314 | 0.496 | 0.053 | -0.175 |
| 2.305929007734904 | 0.497 | 0.05 | -0.175 |
| 2.309070600388493 | 0.497 | 0.047 | -0.175 |
| 2.312212193042083 | 0.498 | 0.044 | -0.174 |
| 2.315353785695672 | 0.499 | 0.041 | -0.174 |
| 2.318495378349262 | 0.499 | 0.038 | -0.174 |
| 2.321636971002852 | 0.5 | 0.034 | -0.174 |
| 2.324778563656441 | 0.501 | 0.031 | -0.173 |
| 2.327920156310031 | 0.501 | 0.028 | -0.173 |
| 2.33106174896362 | 0.502 | 0.025 | -0.173 |
| 2.33420334161721 | 0.503 | 0.022 | -0.172 |
| 2.3373449342708 | 0.503 | 0.019 | -0.172 |
| 2.340486526924389 | 0.504 | 0.016 | -0.171 |
| 2.343628119577979 | 0.504 | 0.013 | -0.171 |
| 2.346769712231568 | 0.505 | 0.009 | -0.17 |
| 2.349911304885158 | 0.506 | 0.006 | -0.17 |
| 2.353052897538748 | 0.506 | 0.003 | -0.169 |
| 2.356194490192337 | 0.507 | 0 | -0.169 |
| 2.359336082845927 | 0.507 | -0.003 | -0.168 |
| 2.362477675499516 | 0.508 | -0.006 | -0.168 |
| 2.365619268153106 | 0.508 | -0.009 | -0.167 |
| 2.368760860806696 | 0.509 | -0.013 | -0.166 |
| 2.371902453460285 | 0.509 | -0.016 | -0.166 |
| 2.375044046113875 | 0.51 | -0.019 | -0.165 |
| 2.378185638767464 | 0.51 | -0.022 | -0.164 |
| 2.381327231421054 | 0.511 | -0.025 | -0.164 |
| 2.384468824074644 | 0.511 | -0.028 | -0.163 |
| 2.387610416728233 | 0.512 | -0.031 | -0.162 |
| 2.390752009381823 | 0.512 | -0.034 | -0.161 |
| 2.393893602035412 | 0.513 | -0.038 | -0.16 |
| 2.397035194689002 | 0.513 | -0.041 | -0.159 |
| 2.400176787342591 | 0.514 | -0.044 | -0.158 |
| 2.403318379996181 | 0.514 | -0.047 | -0.157 |
| 2.406459972649771 | 0.515 | -0.05 | -0.156 |
| 2.40960156530336 | 0.515 | -0.053 | -0.155 |
| 2.41274315795695 | 0.515 | -0.056 | -0.154 |
| 2.41588475061054 | 0.516 | -0.059 | -0.153 |
| 2.419026343264129 | 0.516 | -0.062 | -0.152 |
| 2.422167935917719 | 0.517 | -0.065 | -0.15 |
| 2.425309528571308 | 0.517 | -0.068 | -0.149 |
| 2.428451121224898 | 0.517 | -0.071 | -0.148 |
| 2.431592713878488 | 0.518 | -0.074 | -0.146 |
| 2.434734306532077 | 0.518 | -0.077 | -0.145 |
| 2.437875899185667 | 0.518 | -0.08 | -0.144 |
| 2.441017491839256 | 0.519 | -0.083 | -0.142 |
| 2.444159084492846 | 0.519 | -0.086 | -0.141 |
| 2.447300677146435 | 0.52 | -0.089 | -0.139 |
| 2.450442269800025 | 0.52 | -0.092 | -0.137 |
| 2.453583862453615 | 0.52 | -0.094 | -0.136 |
| 2.456725455107204 | 0.521 | -0.097 | -0.134 |
| 2.459867047760794 | 0.521 | -0.1 | -0.132 |
| 2.463008640414384 | 0.521 | -0.103 | -0.131 |
| 2.466150233067973 | 0.521 | -0.106 | -0.129 |
| 2.469291825721563 | 0.522 | -0.108 | -0.127 |
| 2.472433418375152 | 0.522 | -0.111 | -0.125 |
| 2.475575011028742 | 0.522 | -0.114 | -0.123 |
| 2.478716603682332 | 0.523 | -0.117 | -0.121 |
| 2.481858196335921 | 0.523 | -0.119 | -0.119 |
| 2.48499978898951 | 0.523 | -0.122 | -0.117 |
| 2.4881413816431 | 0.523 | -0.125 | -0.115 |
| 2.49128297429669 | 0.524 | -0.127 | -0.113 |
| 2.49442456695028 | 0.524 | -0.13 | -0.111 |
| 2.497566159603869 | 0.524 | -0.132 | -0.108 |
| 2.500707752257458 | 0.524 | -0.135 | -0.106 |
| 2.503849344911048 | 0.525 | -0.138 | -0.104 |
| 2.506990937564638 | 0.525 | -0.14 | -0.101 |
| 2.510132530218228 | 0.525 | -0.142 | -0.099 |
| 2.513274122871817 | 0.525 | -0.145 | -0.097 |
| 2.516415715525407 | 0.526 | -0.147 | -0.094 |
| 2.519557308178996 | 0.526 | -0.15 | -0.092 |
| 2.522698900832586 | 0.526 | -0.152 | -0.089 |
| 2.525840493486176 | 0.526 | -0.155 | -0.087 |
| 2.528982086139765 | 0.526 | -0.157 | -0.084 |
| 2.532123678793355 | 0.527 | -0.159 | -0.081 |
| 2.535265271446944 | 0.527 | -0.161 | -0.079 |
| 2.538406864100534 | 0.527 | -0.164 | -0.076 |
| 2.541548456754124 | 0.527 | -0.166 | -0.073 |
| 2.544690049407713 | 0.527 | -0.168 | -0.07 |
| 2.547831642061302 | 0.527 | -0.17 | -0.068 |
| 2.550973234714892 | 0.528 | -0.172 | -0.065 |
| 2.554114827368482 | 0.528 | -0.175 | -0.062 |
| 2.557256420022072 | 0.528 | -0.177 | -0.059 |
| 2.560398012675661 | 0.528 | -0.179 | -0.056 |
| 2.563539605329251 | 0.528 | -0.181 | -0.053 |
| 2.56668119798284 | 0.528 | -0.183 | -0.05 |
| 2.56982279063643 | 0.529 | -0.185 | -0.047 |
| 2.57296438329002 | 0.529 | -0.187 | -0.044 |
| 2.576105975943609 | 0.529 | -0.189 | -0.041 |
| 2.579247568597199 | 0.529 | -0.19 | -0.038 |
| 2.582389161250788 | 0.529 | -0.192 | -0.035 |
| 2.585530753904377 | 0.529 | -0.194 | -0.032 |
| 2.588672346557967 | 0.529 | -0.196 | -0.029 |
| 2.591813939211557 | 0.53 | -0.198 | -0.026 |
| 2.594955531865147 | 0.53 | -0.199 | -0.023 |
| 2.598097124518736 | 0.53 | -0.201 | -0.02 |
| 2.601238717172326 | 0.53 | -0.203 | -0.017 |
| 2.604380309825915 | 0.53 | -0.205 | -0.014 |
| 2.607521902479505 | 0.53 | -0.206 | -0.01 |
| 2.610663495133095 | 0.53 | -0.208 | -0.007 |
| 2.613805087786684 | 0.53 | -0.209 | -0.004 |
| 2.616946680440274 | 0.53 | -0.211 | -0.001 |
| 2.620088273093863 | 0.531 | -0.212 | 0.002 |
| 2.623229865747452 | 0.531 | -0.214 | 0.005 |
| 2.626371458401042 | 0.531 | -0.215 | 0.008 |
| 2.629513051054632 | 0.531 | -0.217 | 0.012 |
| 2.632654643708222 | 0.531 | -0.218 | 0.015 |
| 2.635796236361811 | 0.531 | -0.22 | 0.018 |
| 2.638937829015401 | 0.531 | -0.221 | 0.021 |
| 2.642079421668991 | 0.531 | -0.222 | 0.024 |
| 2.64522101432258 | 0.531 | -0.224 | 0.027 |
| 2.64836260697617 | 0.531 | -0.225 | 0.03 |
| 2.651504199629759 | 0.531 | -0.226 | 0.033 |
| 2.654645792283349 | 0.531 | -0.227 | 0.036 |
| 2.657787384936938 | 0.531 | -0.229 | 0.039 |
| 2.660928977590528 | 0.532 | -0.23 | 0.042 |
| 2.664070570244118 | 0.532 | -0.231 | 0.045 |
| 2.667212162897707 | 0.532 | -0.232 | 0.048 |
| 2.670353755551297 | 0.532 | -0.233 | 0.051 |
| 2.673495348204887 | 0.532 | -0.234 | 0.054 |
| 2.676636940858476 | 0.532 | -0.235 | 0.057 |
| 2.679778533512066 | 0.532 | -0.236 | 0.06 |
| 2.682920126165655 | 0.532 | -0.237 | 0.063 |
| 2.686061718819245 | 0.532 | -0.238 | 0.066 |
| 2.689203311472835 | 0.532 | -0.239 | 0.069 |
| 2.692344904126424 | 0.532 | -0.24 | 0.071 |
| 2.695486496780014 | 0.532 | -0.241 | 0.074 |
| 2.698628089433603 | 0.532 | -0.242 | 0.077 |
| 2.701769682087193 | 0.532 | -0.243 | 0.08 |
| 2.704911274740782 | 0.532 | -0.244 | 0.082 |
| 2.708052867394372 | 0.532 | -0.245 | 0.085 |
| 2.711194460047962 | 0.532 | -0.245 | 0.087 |
| 2.714336052701551 | 0.532 | -0.246 | 0.09 |
| 2.717477645355141 | 0.532 | -0.247 | 0.093 |
| 2.720619238008731 | 0.533 | -0.248 | 0.095 |
| 2.72376083066232 | 0.533 | -0.248 | 0.097 |
| 2.72690242331591 | 0.533 | -0.249 | 0.1 |
| 2.730044015969499 | 0.533 | -0.25 | 0.102 |
| 2.733185608623089 | 0.533 | -0.25 | 0.105 |
| 2.736327201276678 | 0.533 | -0.251 | 0.107 |
| 2.739468793930268 | 0.533 | -0.252 | 0.109 |
| 2.742610386583858 | 0.533 | -0.252 | 0.111 |
| 2.745751979237447 | 0.533 | -0.253 | 0.114 |
| 2.748893571891036 | 0.533 | -0.253 | 0.116 |
| 2.752035164544627 | 0.533 | -0.254 | 0.118 |
| 2.755176757198216 | 0.533 | -0.254 | 0.12 |
| 2.758318349851806 | 0.533 | -0.255 | 0.122 |
| 2.761459942505395 | 0.533 | -0.255 | 0.124 |
| 2.764601535158985 | 0.533 | -0.256 | 0.126 |
| 2.767743127812574 | 0.533 | -0.256 | 0.128 |
| 2.770884720466164 | 0.533 | -0.257 | 0.129 |
| 2.774026313119754 | 0.533 | -0.257 | 0.131 |
| 2.777167905773343 | 0.533 | -0.258 | 0.133 |
| 2.780309498426932 | 0.533 | -0.258 | 0.135 |
| 2.783451091080522 | 0.533 | -0.259 | 0.136 |
| 2.786592683734112 | 0.533 | -0.259 | 0.138 |
| 2.789734276387701 | 0.533 | -0.259 | 0.14 |
| 2.792875869041291 | 0.533 | -0.26 | 0.141 |
| 2.796017461694881 | 0.533 | -0.26 | 0.143 |
| 2.79915905434847 | 0.533 | -0.26 | 0.144 |
| 2.80230064700206 | 0.533 | -0.261 | 0.146 |
| 2.80544223965565 | 0.533 | -0.261 | 0.147 |
| 2.808583832309239 | 0.533 | -0.261 | 0.148 |
| 2.811725424962829 | 0.533 | -0.261 | 0.15 |
| 2.814867017616419 | 0.533 | -0.262 | 0.151 |
| 2.818008610270008 | 0.533 | -0.262 | 0.152 |
| 2.821150202923598 | 0.533 | -0.262 | 0.153 |
| 2.824291795577187 | 0.533 | -0.262 | 0.154 |
| 2.827433388230777 | 0.533 | -0.263 | 0.155 |
| 2.830574980884366 | 0.533 | -0.263 | 0.157 |
| 2.833716573537956 | 0.533 | -0.263 | 0.158 |
| 2.836858166191546 | 0.533 | -0.263 | 0.159 |
| 2.839999758845135 | 0.533 | -0.263 | 0.16 |
| 2.843141351498725 | 0.533 | -0.264 | 0.16 |
| 2.846282944152314 | 0.533 | -0.264 | 0.161 |
| 2.849424536805904 | 0.533 | -0.264 | 0.162 |
| 2.852566129459494 | 0.533 | -0.264 | 0.163 |
| 2.855707722113083 | 0.533 | -0.264 | 0.164 |
| 2.858849314766673 | 0.533 | -0.264 | 0.165 |
| 2.861990907420262 | 0.533 | -0.265 | 0.165 |
| 2.865132500073852 | 0.533 | -0.265 | 0.166 |
| 2.868274092727442 | 0.533 | -0.265 | 0.167 |
| 2.871415685381031 | 0.533 | -0.265 | 0.167 |
| 2.874557278034621 | 0.533 | -0.265 | 0.168 |
| 2.87769887068821 | 0.533 | -0.265 | 0.169 |
| 2.8808404633418 | 0.533 | -0.265 | 0.169 |
| 2.88398205599539 | 0.533 | -0.265 | 0.17 |
| 2.88712364864898 | 0.533 | -0.265 | 0.17 |
| 2.890265241302569 | 0.533 | -0.266 | 0.171 |
| 2.893406833956158 | 0.533 | -0.266 | 0.171 |
| 2.896548426609748 | 0.533 | -0.266 | 0.172 |
| 2.899690019263338 | 0.533 | -0.266 | 0.172 |
| 2.902831611916927 | 0.533 | -0.266 | 0.172 |
| 2.905973204570517 | 0.533 | -0.266 | 0.173 |
| 2.909114797224106 | 0.533 | -0.266 | 0.173 |
| 2.912256389877696 | 0.533 | -0.266 | 0.173 |
| 2.915397982531286 | 0.533 | -0.266 | 0.174 |
| 2.918539575184875 | 0.533 | -0.266 | 0.174 |
| 2.921681167838465 | 0.533 | -0.266 | 0.174 |
| 2.924822760492054 | 0.533 | -0.266 | 0.175 |
| 2.927964353145644 | 0.533 | -0.266 | 0.175 |
| 2.931105945799234 | 0.533 | -0.266 | 0.175 |
| 2.934247538452823 | 0.533 | -0.266 | 0.175 |
| 2.937389131106413 | 0.533 | -0.266 | 0.175 |
| 2.940530723760002 | 0.533 | -0.266 | 0.176 |
| 2.943672316413592 | 0.533 | -0.266 | 0.176 |
| 2.946813909067182 | 0.533 | -0.266 | 0.176 |
| 2.949955501720771 | 0.533 | -0.266 | 0.176 |
| 2.953097094374361 | 0.533 | -0.266 | 0.176 |
| 2.95623868702795 | 0.533 | -0.266 | 0.176 |
| 2.95938027968154 | 0.533 | -0.266 | 0.177 |
| 2.96252187233513 | 0.533 | -0.267 | 0.177 |
| 2.965663464988719 | 0.533 | -0.267 | 0.177 |
| 2.968805057642309 | 0.533 | -0.267 | 0.177 |
| 2.971946650295898 | 0.533 | -0.267 | 0.177 |
| 2.975088242949488 | 0.533 | -0.267 | 0.177 |
| 2.978229835603078 | 0.533 | -0.267 | 0.177 |
| 2.981371428256667 | 0.533 | -0.267 | 0.177 |
| 2.984513020910257 | 0.533 | -0.267 | 0.177 |
| 2.987654613563846 | 0.533 | -0.267 | 0.177 |
| 2.990796206217436 | 0.533 | -0.267 | 0.177 |
| 2.993937798871025 | 0.533 | -0.267 | 0.177 |
| 2.997079391524615 | 0.533 | -0.267 | 0.177 |
| 3.000220984178205 | 0.533 | -0.267 | 0.177 |
| 3.003362576831794 | 0.533 | -0.267 | 0.178 |
| 3.006504169485384 | 0.533 | -0.267 | 0.178 |
| 3.009645762138974 | 0.533 | -0.267 | 0.178 |
| 3.012787354792563 | 0.533 | -0.267 | 0.178 |
| 3.015928947446153 | 0.533 | -0.267 | 0.178 |
| 3.019070540099742 | 0.533 | -0.267 | 0.178 |
| 3.022212132753332 | 0.533 | -0.267 | 0.178 |
| 3.025353725406922 | 0.533 | -0.267 | 0.178 |
| 3.028495318060511 | 0.533 | -0.267 | 0.178 |
| 3.031636910714101 | 0.533 | -0.267 | 0.178 |
| 3.03477850336769 | 0.533 | -0.267 | 0.178 |
| 3.03792009602128 | 0.533 | -0.267 | 0.178 |
| 3.04106168867487 | 0.533 | -0.267 | 0.178 |
| 3.04420328132846 | 0.533 | -0.267 | 0.178 |
| 3.047344873982049 | 0.533 | -0.267 | 0.178 |
| 3.050486466635638 | 0.533 | -0.267 | 0.178 |
| 3.053628059289228 | 0.533 | -0.267 | 0.178 |
| 3.056769651942818 | 0.533 | -0.267 | 0.178 |
| 3.059911244596407 | 0.533 | -0.267 | 0.178 |
| 3.063052837249997 | 0.533 | -0.267 | 0.178 |
| 3.066194429903586 | 0.533 | -0.267 | 0.178 |
| 3.069336022557176 | 0.533 | -0.267 | 0.178 |
| 3.072477615210766 | 0.533 | -0.267 | 0.178 |
| 3.075619207864355 | 0.533 | -0.267 | 0.178 |
| 3.078760800517945 | 0.533 | -0.267 | 0.178 |
| 3.081902393171534 | 0.533 | -0.267 | 0.178 |
| 3.085043985825124 | 0.533 | -0.267 | 0.178 |
| 3.088185578478713 | 0.533 | -0.267 | 0.178 |
| 3.091327171132303 | 0.533 | -0.267 | 0.178 |
| 3.094468763785893 | 0.533 | -0.267 | 0.178 |
| 3.097610356439482 | 0.533 | -0.267 | 0.178 |
| 3.100751949093072 | 0.533 | -0.267 | 0.178 |
| 3.103893541746661 | 0.533 | -0.267 | 0.178 |
| 3.107035134400251 | 0.533 | -0.267 | 0.178 |
| 3.110176727053841 | 0.533 | -0.267 | 0.178 |
| 3.11331831970743 | 0.533 | -0.267 | 0.178 |
| 3.11645991236102 | 0.533 | -0.267 | 0.178 |
| 3.11960150501461 | 0.533 | -0.267 | 0.178 |
| 3.122743097668199 | 0.533 | -0.267 | 0.178 |
| 3.125884690321789 | 0.533 | -0.267 | 0.178 |
| 3.129026282975378 | 0.533 | -0.267 | 0.178 |
| 3.132167875628968 | 0.533 | -0.267 | 0.178 |
| 3.135309468282557 | 0.533 | -0.267 | 0.178 |
| 3.138451060936147 | 0.533 | -0.267 | 0.178 |
| 3.141592653589737 | 0.533 | -0.267 | 0.178 |
| 3.144734246243326 | 0.533 | -0.267 | 0.178 |
| 3.147875838896916 | 0.533 | -0.267 | 0.178 |
| 3.151017431550505 | 0.533 | -0.267 | 0.178 |
| 3.154159024204095 | 0.533 | -0.267 | 0.178 |
| 3.157300616857685 | 0.533 | -0.267 | 0.178 |
| 3.160442209511274 | 0.533 | -0.267 | 0.178 |
| 3.163583802164864 | 0.533 | -0.267 | 0.178 |
| 3.166725394818453 | 0.533 | -0.267 | 0.178 |
| 3.169866987472043 | 0.533 | -0.267 | 0.178 |
| 3.173008580125633 | 0.533 | -0.267 | 0.178 |
| 3.176150172779222 | 0.533 | -0.267 | 0.178 |
| 3.179291765432812 | 0.533 | -0.267 | 0.178 |
| 3.182433358086401 | 0.533 | -0.267 | 0.178 |
| 3.185574950739991 | 0.533 | -0.267 | 0.178 |
| 3.188716543393581 | 0.533 | -0.267 | 0.178 |
| 3.19185813604717 | 0.533 | -0.267 | 0.178 |
| 3.19499972870076 | 0.533 | -0.267 | 0.178 |
| 3.198141321354349 | 0.533 | -0.267 | 0.178 |
| 3.20128291400794 | 0.533 | -0.267 | 0.178 |
| 3.204424506661528 | 0.533 | -0.267 | 0.178 |
| 3.207566099315118 | 0.533 | -0.267 | 0.178 |
| 3.210707691968708 | 0.533 | -0.267 | 0.178 |
| 3.213849284622297 | 0.533 | -0.267 | 0.178 |
| 3.216990877275887 | 0.533 | -0.267 | 0.178 |
| 3.220132469929476 | 0.533 | -0.267 | 0.178 |
| 3.223274062583066 | 0.533 | -0.267 | 0.178 |
| 3.226415655236656 | 0.533 | -0.267 | 0.178 |
| 3.229557247890245 | 0.533 | -0.267 | 0.178 |
| 3.232698840543835 | 0.533 | -0.267 | 0.178 |
| 3.235840433197425 | 0.533 | -0.267 | 0.178 |
| 3.238982025851014 | 0.533 | -0.267 | 0.178 |
| 3.242123618504604 | 0.533 | -0.267 | 0.178 |
| 3.245265211158193 | 0.533 | -0.267 | 0.178 |
| 3.248406803811783 | 0.533 | -0.267 | 0.178 |
| 3.251548396465373 | 0.533 | -0.267 | 0.178 |
| 3.254689989118962 | 0.533 | -0.267 | 0.178 |
| 3.257831581772551 | 0.533 | -0.267 | 0.178 |
| 3.260973174426141 | 0.533 | -0.267 | 0.178 |
| 3.26411476707973 | 0.533 | -0.267 | 0.178 |
| 3.267256359733321 | 0.533 | -0.267 | 0.178 |
| 3.27039795238691 | 0.533 | -0.267 | 0.178 |
| 3.2735395450405 | 0.533 | -0.267 | 0.178 |
| 3.276681137694089 | 0.533 | -0.267 | 0.178 |
| 3.279822730347679 | 0.533 | -0.267 | 0.178 |
| 3.282964323001269 | 0.533 | -0.267 | 0.177 |
| 3.286105915654858 | 0.533 | -0.267 | 0.177 |
| 3.289247508308448 | 0.533 | -0.267 | 0.177 |
| 3.292389100962037 | 0.533 | -0.267 | 0.177 |
| 3.295530693615627 | 0.533 | -0.267 | 0.177 |
| 3.298672286269217 | 0.533 | -0.267 | 0.177 |
| 3.301813878922806 | 0.533 | -0.267 | 0.177 |
| 3.304955471576396 | 0.533 | -0.267 | 0.177 |
| 3.308097064229985 | 0.533 | -0.267 | 0.177 |
| 3.311238656883575 | 0.533 | -0.267 | 0.177 |
| 3.314380249537165 | 0.533 | -0.267 | 0.177 |
| 3.317521842190754 | 0.533 | -0.267 | 0.177 |
| 3.320663434844344 | 0.533 | -0.267 | 0.177 |
| 3.323805027497933 | 0.533 | -0.266 | 0.177 |
| 3.326946620151523 | 0.533 | -0.266 | 0.176 |
| 3.330088212805113 | 0.533 | -0.266 | 0.176 |
| 3.333229805458702 | 0.533 | -0.266 | 0.176 |
| 3.336371398112292 | 0.533 | -0.266 | 0.176 |
| 3.339512990765881 | 0.533 | -0.266 | 0.176 |
| 3.342654583419471 | 0.533 | -0.266 | 0.176 |
| 3.345796176073061 | 0.533 | -0.266 | 0.175 |
| 3.34893776872665 | 0.533 | -0.266 | 0.175 |
| 3.35207936138024 | 0.533 | -0.266 | 0.175 |
| 3.355220954033829 | 0.533 | -0.266 | 0.175 |
| 3.358362546687419 | 0.533 | -0.266 | 0.175 |
| 3.361504139341009 | 0.533 | -0.266 | 0.174 |
| 3.364645731994598 | 0.533 | -0.266 | 0.174 |
| 3.367787324648188 | 0.533 | -0.266 | 0.174 |
| 3.370928917301777 | 0.533 | -0.266 | 0.173 |
| 3.374070509955367 | 0.533 | -0.266 | 0.173 |
| 3.377212102608956 | 0.533 | -0.266 | 0.173 |
| 3.380353695262546 | 0.533 | -0.266 | 0.172 |
| 3.383495287916136 | 0.533 | -0.266 | 0.172 |
| 3.386636880569725 | 0.533 | -0.266 | 0.172 |
| 3.389778473223315 | 0.533 | -0.266 | 0.171 |
| 3.392920065876904 | 0.533 | -0.266 | 0.171 |
| 3.396061658530494 | 0.533 | -0.265 | 0.17 |
| 3.399203251184084 | 0.533 | -0.265 | 0.17 |
| 3.402344843837673 | 0.533 | -0.265 | 0.169 |
| 3.405486436491263 | 0.533 | -0.265 | 0.169 |
| 3.408628029144852 | 0.533 | -0.265 | 0.168 |
| 3.411769621798442 | 0.533 | -0.265 | 0.167 |
| 3.414911214452032 | 0.533 | -0.265 | 0.167 |
| 3.418052807105621 | 0.533 | -0.265 | 0.166 |
| 3.421194399759211 | 0.533 | -0.265 | 0.165 |
| 3.4243359924128 | 0.533 | -0.264 | 0.165 |
| 3.42747758506639 | 0.533 | -0.264 | 0.164 |
| 3.43061917771998 | 0.533 | -0.264 | 0.163 |
| 3.433760770373569 | 0.533 | -0.264 | 0.162 |
| 3.436902363027159 | 0.533 | -0.264 | 0.161 |
| 3.440043955680748 | 0.533 | -0.264 | 0.16 |
| 3.443185548334338 | 0.533 | -0.263 | 0.16 |
| 3.446327140987927 | 0.533 | -0.263 | 0.159 |
| 3.449468733641517 | 0.533 | -0.263 | 0.158 |
| 3.452610326295107 | 0.533 | -0.263 | 0.157 |
| 3.455751918948696 | 0.533 | -0.263 | 0.155 |
| 3.458893511602286 | 0.533 | -0.262 | 0.154 |
| 3.462035104255876 | 0.533 | -0.262 | 0.153 |
| 3.465176696909465 | 0.533 | -0.262 | 0.152 |
| 3.468318289563055 | 0.533 | -0.262 | 0.151 |
| 3.471459882216644 | 0.533 | -0.261 | 0.15 |
| 3.474601474870234 | 0.533 | -0.261 | 0.148 |
| 3.477743067523824 | 0.533 | -0.261 | 0.147 |
| 3.480884660177413 | 0.533 | -0.261 | 0.146 |
| 3.484026252831002 | 0.533 | -0.26 | 0.144 |
| 3.487167845484592 | 0.533 | -0.26 | 0.143 |
| 3.490309438138182 | 0.533 | -0.26 | 0.141 |
| 3.493451030791772 | 0.533 | -0.259 | 0.14 |
| 3.496592623445361 | 0.533 | -0.259 | 0.138 |
| 3.499734216098951 | 0.533 | -0.259 | 0.136 |
| 3.50287580875254 | 0.533 | -0.258 | 0.135 |
| 3.50601740140613 | 0.533 | -0.258 | 0.133 |
| 3.50915899405972 | 0.533 | -0.257 | 0.131 |
| 3.512300586713309 | 0.533 | -0.257 | 0.129 |
| 3.515442179366899 | 0.533 | -0.256 | 0.128 |
| 3.518583772020488 | 0.533 | -0.256 | 0.126 |
| 3.521725364674078 | 0.533 | -0.255 | 0.124 |
| 3.524866957327668 | 0.533 | -0.255 | 0.122 |
| 3.528008549981257 | 0.533 | -0.254 | 0.12 |
| 3.531150142634847 | 0.533 | -0.254 | 0.118 |
| 3.534291735288436 | 0.533 | -0.253 | 0.116 |
| 3.537433327942026 | 0.533 | -0.253 | 0.114 |
| 3.540574920595616 | 0.533 | -0.252 | 0.111 |
| 3.543716513249205 | 0.533 | -0.252 | 0.109 |
| 3.546858105902795 | 0.533 | -0.251 | 0.107 |
| 3.549999698556384 | 0.533 | -0.25 | 0.105 |
| 3.553141291209974 | 0.533 | -0.25 | 0.102 |
| 3.556282883863564 | 0.533 | -0.249 | 0.1 |
| 3.559424476517153 | 0.533 | -0.248 | 0.097 |
| 3.562566069170743 | 0.533 | -0.248 | 0.095 |
| 3.565707661824332 | 0.532 | -0.247 | 0.093 |
| 3.568849254477922 | 0.532 | -0.246 | 0.09 |
| 3.571990847131511 | 0.532 | -0.245 | 0.087 |
| 3.575132439785101 | 0.532 | -0.245 | 0.085 |
| 3.578274032438691 | 0.532 | -0.244 | 0.082 |
| 3.58141562509228 | 0.532 | -0.243 | 0.08 |
| 3.58455721774587 | 0.532 | -0.242 | 0.077 |
| 3.58769881039946 | 0.532 | -0.241 | 0.074 |
| 3.590840403053049 | 0.532 | -0.24 | 0.071 |
| 3.593981995706639 | 0.532 | -0.239 | 0.069 |
| 3.597123588360228 | 0.532 | -0.238 | 0.066 |
| 3.600265181013818 | 0.532 | -0.237 | 0.063 |
| 3.603406773667407 | 0.532 | -0.236 | 0.06 |
| 3.606548366320997 | 0.532 | -0.235 | 0.057 |
| 3.609689958974587 | 0.532 | -0.234 | 0.054 |
| 3.612831551628176 | 0.532 | -0.233 | 0.051 |
| 3.615973144281766 | 0.532 | -0.232 | 0.048 |
| 3.619114736935355 | 0.532 | -0.231 | 0.045 |
| 3.622256329588945 | 0.532 | -0.23 | 0.042 |
| 3.625397922242534 | 0.531 | -0.229 | 0.039 |
| 3.628539514896124 | 0.531 | -0.227 | 0.036 |
| 3.631681107549714 | 0.531 | -0.226 | 0.033 |
| 3.634822700203303 | 0.531 | -0.225 | 0.03 |
| 3.637964292856893 | 0.531 | -0.224 | 0.027 |
| 3.641105885510483 | 0.531 | -0.222 | 0.024 |
| 3.644247478164072 | 0.531 | -0.221 | 0.021 |
| 3.647389070817662 | 0.531 | -0.22 | 0.018 |
| 3.650530663471251 | 0.531 | -0.218 | 0.015 |
| 3.653672256124841 | 0.531 | -0.217 | 0.012 |
| 3.656813848778431 | 0.531 | -0.215 | 0.008 |
| 3.65995544143202 | 0.531 | -0.214 | 0.005 |
| 3.66309703408561 | 0.531 | -0.212 | 0.002 |
| 3.666238626739199 | 0.53 | -0.211 | -0.001 |
| 3.66938021939279 | 0.53 | -0.209 | -0.004 |
| 3.672521812046378 | 0.53 | -0.208 | -0.007 |
| 3.675663404699968 | 0.53 | -0.206 | -0.01 |
| 3.678804997353558 | 0.53 | -0.205 | -0.014 |
| 3.681946590007147 | 0.53 | -0.203 | -0.017 |
| 3.685088182660737 | 0.53 | -0.201 | -0.02 |
| 3.688229775314326 | 0.53 | -0.199 | -0.023 |
| 3.691371367967916 | 0.53 | -0.198 | -0.026 |
| 3.694512960621506 | 0.529 | -0.196 | -0.029 |
| 3.697654553275095 | 0.529 | -0.194 | -0.032 |
| 3.700796145928685 | 0.529 | -0.192 | -0.035 |
| 3.703937738582274 | 0.529 | -0.19 | -0.038 |
| 3.707079331235864 | 0.529 | -0.189 | -0.041 |
| 3.710220923889454 | 0.529 | -0.187 | -0.044 |
| 3.713362516543043 | 0.529 | -0.185 | -0.047 |
| 3.716504109196633 | 0.528 | -0.183 | -0.05 |
| 3.719645701850223 | 0.528 | -0.181 | -0.053 |
| 3.722787294503812 | 0.528 | -0.179 | -0.056 |
| 3.725928887157402 | 0.528 | -0.177 | -0.059 |
| 3.729070479810991 | 0.528 | -0.175 | -0.062 |
| 3.732212072464581 | 0.528 | -0.172 | -0.065 |
| 3.735353665118171 | 0.527 | -0.17 | -0.068 |
| 3.73849525777176 | 0.527 | -0.168 | -0.07 |
| 3.74163685042535 | 0.527 | -0.166 | -0.073 |
| 3.744778443078939 | 0.527 | -0.164 | -0.076 |
| 3.747920035732529 | 0.527 | -0.161 | -0.079 |
| 3.751061628386119 | 0.527 | -0.159 | -0.081 |
| 3.754203221039708 | 0.526 | -0.157 | -0.084 |
| 3.757344813693298 | 0.526 | -0.155 | -0.087 |
| 3.760486406346887 | 0.526 | -0.152 | -0.089 |
| 3.763627999000477 | 0.526 | -0.15 | -0.092 |
| 3.766769591654067 | 0.526 | -0.147 | -0.094 |
| 3.769911184307656 | 0.525 | -0.145 | -0.097 |
| 3.773052776961246 | 0.525 | -0.142 | -0.099 |
| 3.776194369614835 | 0.525 | -0.14 | -0.101 |
| 3.779335962268425 | 0.525 | -0.138 | -0.104 |
| 3.782477554922014 | 0.524 | -0.135 | -0.106 |
| 3.785619147575604 | 0.524 | -0.132 | -0.108 |
| 3.788760740229193 | 0.524 | -0.13 | -0.111 |
| 3.791902332882783 | 0.524 | -0.127 | -0.113 |
| 3.795043925536373 | 0.523 | -0.125 | -0.115 |
| 3.798185518189962 | 0.523 | -0.122 | -0.117 |
| 3.801327110843552 | 0.523 | -0.119 | -0.119 |
| 3.804468703497142 | 0.523 | -0.117 | -0.121 |
| 3.807610296150731 | 0.522 | -0.114 | -0.123 |
| 3.810751888804321 | 0.522 | -0.111 | -0.125 |
| 3.813893481457911 | 0.522 | -0.108 | -0.127 |
| 3.8170350741115 | 0.521 | -0.106 | -0.129 |
| 3.82017666676509 | 0.521 | -0.103 | -0.131 |
| 3.823318259418679 | 0.521 | -0.1 | -0.132 |
| 3.826459852072269 | 0.521 | -0.097 | -0.134 |
| 3.829601444725859 | 0.52 | -0.094 | -0.136 |
| 3.832743037379448 | 0.52 | -0.092 | -0.137 |
| 3.835884630033038 | 0.52 | -0.089 | -0.139 |
| 3.839026222686627 | 0.519 | -0.086 | -0.141 |
| 3.842167815340217 | 0.519 | -0.083 | -0.142 |
| 3.845309407993807 | 0.518 | -0.08 | -0.144 |
| 3.848451000647396 | 0.518 | -0.077 | -0.145 |
| 3.851592593300986 | 0.518 | -0.074 | -0.146 |
| 3.854734185954575 | 0.517 | -0.071 | -0.148 |
| 3.857875778608165 | 0.517 | -0.068 | -0.149 |
| 3.861017371261755 | 0.517 | -0.065 | -0.15 |
| 3.864158963915344 | 0.516 | -0.062 | -0.152 |
| 3.867300556568933 | 0.516 | -0.059 | -0.153 |
| 3.870442149222523 | 0.515 | -0.056 | -0.154 |
| 3.873583741876112 | 0.515 | -0.053 | -0.155 |
| 3.876725334529703 | 0.515 | -0.05 | -0.156 |
| 3.879866927183292 | 0.514 | -0.047 | -0.157 |
| 3.883008519836882 | 0.514 | -0.044 | -0.158 |
| 3.886150112490471 | 0.513 | -0.041 | -0.159 |
| 3.889291705144061 | 0.513 | -0.038 | -0.16 |
| 3.892433297797651 | 0.512 | -0.034 | -0.161 |
| 3.89557489045124 | 0.512 | -0.031 | -0.162 |
| 3.89871648310483 | 0.511 | -0.028 | -0.163 |
| 3.901858075758419 | 0.511 | -0.025 | -0.164 |
| 3.904999668412009 | 0.51 | -0.022 | -0.164 |
| 3.908141261065598 | 0.51 | -0.019 | -0.165 |
| 3.911282853719188 | 0.509 | -0.016 | -0.166 |
| 3.914424446372778 | 0.509 | -0.013 | -0.166 |
| 3.917566039026367 | 0.508 | -0.009 | -0.167 |
| 3.920707631679957 | 0.508 | -0.006 | -0.168 |
| 3.923849224333547 | 0.507 | -0.003 | -0.168 |
| 3.926990816987136 | 0.507 | 0 | -0.169 |
| 3.930132409640726 | 0.506 | 0.003 | -0.169 |
| 3.933274002294315 | 0.506 | 0.006 | -0.17 |
| 3.936415594947905 | 0.505 | 0.009 | -0.17 |
| 3.939557187601495 | 0.504 | 0.013 | -0.171 |
| 3.942698780255084 | 0.504 | 0.016 | -0.171 |
| 3.945840372908674 | 0.503 | 0.019 | -0.172 |
| 3.948981965562263 | 0.503 | 0.022 | -0.172 |
| 3.952123558215853 | 0.502 | 0.025 | -0.173 |
| 3.955265150869442 | 0.501 | 0.028 | -0.173 |
| 3.958406743523032 | 0.501 | 0.031 | -0.173 |
| 3.961548336176622 | 0.5 | 0.034 | -0.174 |
| 3.964689928830211 | 0.499 | 0.038 | -0.174 |
| 3.967831521483801 | 0.499 | 0.041 | -0.174 |
| 3.97097311413739 | 0.498 | 0.044 | -0.174 |
| 3.97411470679098 | 0.497 | 0.047 | -0.175 |
| 3.97725629944457 | 0.497 | 0.05 | -0.175 |
| 3.98039789209816 | 0.496 | 0.053 | -0.175 |
| 3.983539484751749 | 0.495 | 0.056 | -0.175 |
| 3.986681077405338 | 0.495 | 0.059 | -0.176 |
| 3.989822670058928 | 0.494 | 0.062 | -0.176 |
| 3.992964262712517 | 0.493 | 0.065 | -0.176 |
| 3.996105855366107 | 0.492 | 0.068 | -0.176 |
| 3.999247448019697 | 0.492 | 0.071 | -0.176 |
| 4.002389040673287 | 0.491 | 0.074 | -0.176 |
| 4.005530633326877 | 0.49 | 0.077 | -0.177 |
| 4.008672225980466 | 0.489 | 0.08 | -0.177 |
| 4.011813818634056 | 0.488 | 0.083 | -0.177 |
| 4.014955411287645 | 0.487 | 0.086 | -0.177 |
| 4.018097003941234 | 0.487 | 0.089 | -0.177 |
| 4.021238596594824 | 0.486 | 0.092 | -0.177 |
| 4.024380189248414 | 0.485 | 0.094 | -0.177 |
| 4.027521781902004 | 0.484 | 0.097 | -0.177 |
| 4.030663374555593 | 0.483 | 0.1 | -0.177 |
| 4.033804967209183 | 0.482 | 0.103 | -0.177 |
| 4.036946559862773 | 0.481 | 0.106 | -0.177 |
| 4.040088152516362 | 0.48 | 0.108 | -0.177 |
| 4.043229745169951 | 0.48 | 0.111 | -0.177 |
| 4.046371337823541 | 0.479 | 0.114 | -0.177 |
| 4.049512930477131 | 0.478 | 0.117 | -0.178 |
| 4.05265452313072 | 0.477 | 0.119 | -0.178 |
| 4.05579611578431 | 0.476 | 0.122 | -0.178 |
| 4.0589377084379 | 0.475 | 0.125 | -0.178 |
| 4.062079301091489 | 0.474 | 0.127 | -0.178 |
| 4.065220893745079 | 0.473 | 0.13 | -0.178 |
| 4.068362486398668 | 0.472 | 0.132 | -0.178 |
| 4.071504079052258 | 0.471 | 0.135 | -0.178 |
| 4.074645671705848 | 0.47 | 0.138 | -0.178 |
| 4.077787264359437 | 0.469 | 0.14 | -0.178 |
| 4.080928857013027 | 0.468 | 0.142 | -0.178 |
| 4.084070449666616 | 0.466 | 0.145 | -0.178 |
| 4.087212042320206 | 0.465 | 0.147 | -0.178 |
| 4.090353634973795 | 0.464 | 0.15 | -0.178 |
| 4.093495227627385 | 0.463 | 0.152 | -0.178 |
| 4.096636820280975 | 0.462 | 0.155 | -0.178 |
| 4.099778412934564 | 0.461 | 0.157 | -0.178 |
| 4.102920005588154 | 0.46 | 0.159 | -0.178 |
| 4.106061598241744 | 0.459 | 0.161 | -0.178 |
| 4.109203190895333 | 0.457 | 0.164 | -0.178 |
| 4.112344783548923 | 0.456 | 0.166 | -0.178 |
| 4.115486376202512 | 0.455 | 0.168 | -0.178 |
| 4.118627968856102 | 0.454 | 0.17 | -0.178 |
| 4.121769561509692 | 0.452 | 0.172 | -0.178 |
| 4.124911154163281 | 0.451 | 0.175 | -0.178 |
| 4.128052746816871 | 0.45 | 0.177 | -0.178 |
| 4.13119433947046 | 0.449 | 0.179 | -0.178 |
| 4.13433593212405 | 0.447 | 0.181 | -0.178 |
| 4.13747752477764 | 0.446 | 0.183 | -0.178 |
| 4.14061911743123 | 0.445 | 0.185 | -0.178 |
| 4.143760710084818 | 0.443 | 0.187 | -0.178 |
| 4.146902302738408 | 0.442 | 0.189 | -0.178 |
| 4.150043895391998 | 0.441 | 0.19 | -0.178 |
| 4.153185488045588 | 0.439 | 0.192 | -0.178 |
| 4.156327080699177 | 0.438 | 0.194 | -0.178 |
| 4.159468673352766 | 0.437 | 0.196 | -0.178 |
| 4.162610266006356 | 0.435 | 0.198 | -0.178 |
| 4.165751858659946 | 0.434 | 0.199 | -0.178 |
| 4.168893451313535 | 0.432 | 0.201 | -0.178 |
| 4.172035043967125 | 0.431 | 0.203 | -0.178 |
| 4.175176636620715 | 0.429 | 0.205 | -0.178 |
| 4.178318229274304 | 0.428 | 0.206 | -0.178 |
| 4.181459821927894 | 0.426 | 0.208 | -0.178 |
| 4.184601414581484 | 0.425 | 0.209 | -0.178 |
| 4.187743007235073 | 0.423 | 0.211 | -0.178 |
| 4.190884599888663 | 0.422 | 0.212 | -0.178 |
| 4.194026192542252 | 0.42 | 0.214 | -0.178 |
| 4.197167785195842 | 0.419 | 0.215 | -0.178 |
| 4.200309377849432 | 0.417 | 0.217 | -0.178 |
| 4.203450970503021 | 0.416 | 0.218 | -0.178 |
| 4.206592563156611 | 0.414 | 0.22 | -0.178 |
| 4.2097341558102 | 0.412 | 0.221 | -0.178 |
| 4.21287574846379 | 0.411 | 0.222 | -0.178 |
| 4.21601734111738 | 0.409 | 0.224 | -0.178 |
| 4.21915893377097 | 0.407 | 0.225 | -0.178 |
| 4.222300526424559 | 0.406 | 0.226 | -0.178 |
| 4.225442119078148 | 0.404 | 0.227 | -0.178 |
| 4.228583711731738 | 0.402 | 0.229 | -0.178 |
| 4.231725304385327 | 0.401 | 0.23 | -0.178 |
| 4.234866897038917 | 0.399 | 0.231 | -0.178 |
| 4.238008489692506 | 0.397 | 0.232 | -0.178 |
| 4.241150082346096 | 0.395 | 0.233 | -0.178 |
| 4.244291674999685 | 0.394 | 0.234 | -0.178 |
| 4.247433267653276 | 0.392 | 0.235 | -0.178 |
| 4.250574860306865 | 0.39 | 0.236 | -0.178 |
| 4.253716452960455 | 0.388 | 0.237 | -0.178 |
| 4.256858045614044 | 0.386 | 0.238 | -0.178 |
| 4.259999638267634 | 0.385 | 0.239 | -0.178 |
| 4.263141230921224 | 0.383 | 0.24 | -0.178 |
| 4.266282823574813 | 0.381 | 0.241 | -0.178 |
| 4.269424416228403 | 0.379 | 0.242 | -0.178 |
| 4.272566008881992 | 0.377 | 0.243 | -0.178 |
| 4.275707601535582 | 0.375 | 0.244 | -0.178 |
| 4.27884919418917 | 0.373 | 0.245 | -0.178 |
| 4.28199078684276 | 0.371 | 0.245 | -0.178 |
| 4.285132379496351 | 0.369 | 0.246 | -0.178 |
| 4.28827397214994 | 0.367 | 0.247 | -0.178 |
| 4.29141556480353 | 0.365 | 0.248 | -0.178 |
| 4.294557157457119 | 0.363 | 0.248 | -0.178 |
| 4.29769875011071 | 0.361 | 0.249 | -0.178 |
| 4.300840342764299 | 0.359 | 0.25 | -0.178 |
| 4.303981935417888 | 0.357 | 0.25 | -0.178 |
| 4.307123528071478 | 0.355 | 0.251 | -0.178 |
| 4.310265120725067 | 0.353 | 0.252 | -0.178 |
| 4.313406713378657 | 0.351 | 0.252 | -0.178 |
| 4.316548306032247 | 0.349 | 0.253 | -0.178 |
| 4.319689898685836 | 0.347 | 0.253 | -0.178 |
| 4.322831491339426 | 0.345 | 0.254 | -0.178 |
| 4.325973083993015 | 0.343 | 0.254 | -0.178 |
| 4.329114676646605 | 0.341 | 0.255 | -0.178 |
| 4.332256269300195 | 0.338 | 0.255 | -0.177 |
| 4.335397861953784 | 0.336 | 0.256 | -0.177 |
| 4.338539454607374 | 0.334 | 0.256 | -0.177 |
| 4.341681047260963 | 0.332 | 0.257 | -0.177 |
| 4.344822639914553 | 0.33 | 0.257 | -0.177 |
| 4.347964232568143 | 0.327 | 0.258 | -0.177 |
| 4.351105825221732 | 0.325 | 0.258 | -0.177 |
| 4.354247417875322 | 0.323 | 0.259 | -0.177 |
| 4.357389010528911 | 0.321 | 0.259 | -0.177 |
| 4.360530603182501 | 0.318 | 0.259 | -0.177 |
| 4.36367219583609 | 0.316 | 0.26 | -0.177 |
| 4.36681378848968 | 0.314 | 0.26 | -0.177 |
| 4.36995538114327 | 0.311 | 0.26 | -0.177 |
| 4.373096973796859 | 0.309 | 0.261 | -0.176 |
| 4.376238566450449 | 0.307 | 0.261 | -0.176 |
| 4.379380159104038 | 0.304 | 0.261 | -0.176 |
| 4.382521751757628 | 0.302 | 0.261 | -0.176 |
| 4.385663344411217 | 0.3 | 0.262 | -0.176 |
| 4.388804937064807 | 0.297 | 0.262 | -0.176 |
| 4.391946529718397 | 0.295 | 0.262 | -0.176 |
| 4.395088122371987 | 0.292 | 0.262 | -0.175 |
| 4.398229715025576 | 0.29 | 0.263 | -0.175 |
| 4.401371307679165 | 0.287 | 0.263 | -0.175 |
| 4.404512900332755 | 0.285 | 0.263 | -0.175 |
| 4.407654492986345 | 0.283 | 0.263 | -0.174 |
| 4.410796085639934 | 0.28 | 0.263 | -0.174 |
| 4.413937678293524 | 0.278 | 0.264 | -0.174 |
| 4.417079270947114 | 0.275 | 0.264 | -0.174 |
| 4.420220863600703 | 0.272 | 0.264 | -0.173 |
| 4.423362456254293 | 0.27 | 0.264 | -0.173 |
| 4.426504048907883 | 0.267 | 0.264 | -0.172 |
| 4.429645641561472 | 0.265 | 0.264 | -0.172 |
| 4.432787234215062 | 0.262 | 0.265 | -0.172 |
| 4.435928826868651 | 0.26 | 0.265 | -0.171 |
| 4.43907041952224 | 0.257 | 0.265 | -0.171 |
| 4.44221201217583 | 0.254 | 0.265 | -0.17 |
| 4.44535360482942 | 0.252 | 0.265 | -0.17 |
| 4.44849519748301 | 0.249 | 0.265 | -0.169 |
| 4.4516367901366 | 0.247 | 0.265 | -0.169 |
| 4.454778382790188 | 0.244 | 0.265 | -0.168 |
| 4.457919975443779 | 0.241 | 0.265 | -0.168 |
| 4.461061568097368 | 0.239 | 0.266 | -0.167 |
| 4.464203160750958 | 0.236 | 0.266 | -0.166 |
| 4.467344753404547 | 0.233 | 0.266 | -0.166 |
| 4.470486346058137 | 0.231 | 0.266 | -0.165 |
| 4.473627938711726 | 0.228 | 0.266 | -0.164 |
| 4.476769531365316 | 0.225 | 0.266 | -0.163 |
| 4.479911124018905 | 0.222 | 0.266 | -0.162 |
| 4.483052716672495 | 0.22 | 0.266 | -0.162 |
| 4.486194309326085 | 0.217 | 0.266 | -0.161 |
| 4.489335901979674 | 0.214 | 0.266 | -0.16 |
| 4.492477494633264 | 0.211 | 0.266 | -0.159 |
| 4.495619087286854 | 0.209 | 0.266 | -0.158 |
| 4.498760679940443 | 0.206 | 0.266 | -0.157 |
| 4.501902272594033 | 0.203 | 0.266 | -0.156 |
| 4.505043865247622 | 0.2 | 0.266 | -0.155 |
| 4.508185457901212 | 0.197 | 0.266 | -0.154 |
| 4.511327050554801 | 0.194 | 0.266 | -0.152 |
| 4.514468643208391 | 0.192 | 0.266 | -0.151 |
| 4.517610235861981 | 0.189 | 0.266 | -0.15 |
| 4.520751828515571 | 0.186 | 0.266 | -0.149 |
| 4.52389342116916 | 0.183 | 0.266 | -0.147 |
| 4.52703501382275 | 0.18 | 0.266 | -0.146 |
| 4.530176606476339 | 0.177 | 0.266 | -0.145 |
| 4.533318199129928 | 0.174 | 0.267 | -0.143 |
| 4.536459791783518 | 0.171 | 0.267 | -0.142 |
| 4.539601384437108 | 0.169 | 0.267 | -0.14 |
| 4.542742977090698 | 0.166 | 0.267 | -0.139 |
| 4.545884569744287 | 0.163 | 0.267 | -0.137 |
| 4.549026162397876 | 0.16 | 0.267 | -0.135 |
| 4.552167755051466 | 0.157 | 0.267 | -0.134 |
| 4.555309347705056 | 0.154 | 0.267 | -0.132 |
| 4.558450940358646 | 0.151 | 0.267 | -0.13 |
| 4.561592533012235 | 0.148 | 0.267 | -0.128 |
| 4.564734125665825 | 0.145 | 0.267 | -0.126 |
| 4.567875718319415 | 0.142 | 0.267 | -0.124 |
| 4.571017310973004 | 0.139 | 0.267 | -0.122 |
| 4.574158903626594 | 0.136 | 0.267 | -0.12 |
| 4.577300496280183 | 0.133 | 0.267 | -0.118 |
| 4.580442088933772 | 0.13 | 0.267 | -0.116 |
| 4.583583681587362 | 0.127 | 0.267 | -0.114 |
| 4.586725274240952 | 0.124 | 0.267 | -0.112 |
| 4.589866866894542 | 0.121 | 0.267 | -0.11 |
| 4.593008459548131 | 0.118 | 0.267 | -0.108 |
| 4.596150052201721 | 0.115 | 0.267 | -0.105 |
| 4.59929164485531 | 0.112 | 0.267 | -0.103 |
| 4.6024332375089 | 0.109 | 0.267 | -0.101 |
| 4.60557483016249 | 0.106 | 0.267 | -0.098 |
| 4.608716422816079 | 0.103 | 0.267 | -0.096 |
| 4.611858015469668 | 0.1 | 0.267 | -0.093 |
| 4.614999608123258 | 0.097 | 0.267 | -0.091 |
| 4.618141200776848 | 0.094 | 0.267 | -0.088 |
| 4.621282793430437 | 0.09 | 0.267 | -0.086 |
| 4.624424386084027 | 0.087 | 0.267 | -0.083 |
| 4.627565978737617 | 0.084 | 0.267 | -0.08 |
| 4.630707571391206 | 0.081 | 0.267 | -0.078 |
| 4.633849164044795 | 0.078 | 0.267 | -0.075 |
| 4.636990756698386 | 0.075 | 0.267 | -0.072 |
| 4.640132349351975 | 0.072 | 0.267 | -0.07 |
| 4.643273942005564 | 0.069 | 0.267 | -0.067 |
| 4.646415534659154 | 0.066 | 0.267 | -0.064 |
| 4.649557127312744 | 0.063 | 0.267 | -0.061 |
| 4.652698719966334 | 0.06 | 0.267 | -0.058 |
| 4.655840312619923 | 0.056 | 0.267 | -0.055 |
| 4.658981905273513 | 0.053 | 0.267 | -0.052 |
| 4.662123497927102 | 0.05 | 0.267 | -0.049 |
| 4.665265090580692 | 0.047 | 0.267 | -0.046 |
| 4.668406683234282 | 0.044 | 0.267 | -0.043 |
| 4.671548275887871 | 0.041 | 0.267 | -0.04 |
| 4.674689868541461 | 0.038 | 0.267 | -0.037 |
| 4.67783146119505 | 0.035 | 0.267 | -0.034 |
| 4.68097305384864 | 0.031 | 0.267 | -0.031 |
| 4.68411464650223 | 0.028 | 0.267 | -0.028 |
| 4.687256239155819 | 0.025 | 0.267 | -0.025 |
| 4.690397831809409 | 0.022 | 0.267 | -0.022 |
| 4.693539424462998 | 0.019 | 0.267 | -0.019 |
| 4.696681017116588 | 0.016 | 0.267 | -0.016 |
| 4.699822609770177 | 0.013 | 0.267 | -0.013 |
| 4.702964202423767 | 0.009 | 0.267 | -0.009 |
| 4.706105795077356 | 0.006 | 0.267 | -0.006 |
| 4.709247387730946 | 0.003 | 0.267 | -0.003 |
| 4.712388980384535 | 0 | 0.267 | 0 |
| 4.715530573038126 | -0.003 | 0.267 | 0.003 |
| 4.718672165691715 | -0.006 | 0.267 | 0.006 |
| 4.721813758345305 | -0.009 | 0.267 | 0.009 |
| 4.724955350998894 | -0.013 | 0.267 | 0.013 |
| 4.728096943652484 | -0.016 | 0.267 | 0.016 |
| 4.731238536306074 | -0.019 | 0.267 | 0.019 |
| 4.734380128959663 | -0.022 | 0.267 | 0.022 |
| 4.737521721613253 | -0.025 | 0.267 | 0.025 |
| 4.740663314266842 | -0.028 | 0.267 | 0.028 |
| 4.743804906920432 | -0.031 | 0.267 | 0.031 |
| 4.74694649957402 | -0.035 | 0.267 | 0.034 |
| 4.750088092227611 | -0.038 | 0.267 | 0.037 |
| 4.7532296848812 | -0.041 | 0.267 | 0.04 |
| 4.75637127753479 | -0.044 | 0.267 | 0.043 |
| 4.75951287018838 | -0.047 | 0.267 | 0.046 |
| 4.76265446284197 | -0.05 | 0.267 | 0.049 |
| 4.765796055495559 | -0.053 | 0.267 | 0.052 |
| 4.768937648149149 | -0.056 | 0.267 | 0.055 |
| 4.772079240802738 | -0.06 | 0.267 | 0.058 |
| 4.775220833456327 | -0.063 | 0.267 | 0.061 |
| 4.778362426109917 | -0.066 | 0.267 | 0.064 |
| 4.781504018763507 | -0.069 | 0.267 | 0.067 |
| 4.784645611417097 | -0.072 | 0.267 | 0.07 |
| 4.787787204070686 | -0.075 | 0.267 | 0.072 |
| 4.790928796724275 | -0.078 | 0.267 | 0.075 |
| 4.794070389377865 | -0.081 | 0.267 | 0.078 |
| 4.797211982031455 | -0.084 | 0.267 | 0.08 |
| 4.800353574685045 | -0.087 | 0.267 | 0.083 |
| 4.803495167338634 | -0.09 | 0.267 | 0.086 |
| 4.806636759992224 | -0.094 | 0.267 | 0.088 |
| 4.809778352645814 | -0.097 | 0.267 | 0.091 |
| 4.812919945299403 | -0.1 | 0.267 | 0.093 |
| 4.816061537952993 | -0.103 | 0.267 | 0.096 |
| 4.819203130606582 | -0.106 | 0.267 | 0.098 |
| 4.822344723260172 | -0.109 | 0.267 | 0.101 |
| 4.825486315913761 | -0.112 | 0.267 | 0.103 |
| 4.828627908567351 | -0.115 | 0.267 | 0.105 |
| 4.83176950122094 | -0.118 | 0.267 | 0.108 |
| 4.83491109387453 | -0.121 | 0.267 | 0.11 |
| 4.83805268652812 | -0.124 | 0.267 | 0.112 |
| 4.841194279181709 | -0.127 | 0.267 | 0.114 |
| 4.844335871835299 | -0.13 | 0.267 | 0.116 |
| 4.847477464488889 | -0.133 | 0.267 | 0.118 |
| 4.850619057142478 | -0.136 | 0.267 | 0.12 |
| 4.853760649796068 | -0.139 | 0.267 | 0.122 |
| 4.856902242449657 | -0.142 | 0.267 | 0.124 |
| 4.860043835103247 | -0.145 | 0.267 | 0.126 |
| 4.863185427756837 | -0.148 | 0.267 | 0.128 |
| 4.866327020410426 | -0.151 | 0.267 | 0.13 |
| 4.869468613064015 | -0.154 | 0.267 | 0.132 |
| 4.872610205717605 | -0.157 | 0.267 | 0.134 |
| 4.875751798371195 | -0.16 | 0.267 | 0.135 |
| 4.878893391024784 | -0.163 | 0.267 | 0.137 |
| 4.882034983678374 | -0.166 | 0.267 | 0.139 |
| 4.885176576331964 | -0.169 | 0.267 | 0.14 |
| 4.888318168985553 | -0.171 | 0.267 | 0.142 |
| 4.891459761639143 | -0.174 | 0.267 | 0.143 |
| 4.894601354292733 | -0.177 | 0.266 | 0.145 |
| 4.897742946946322 | -0.18 | 0.266 | 0.146 |
| 4.900884539599912 | -0.183 | 0.266 | 0.147 |
| 4.904026132253501 | -0.186 | 0.266 | 0.149 |
| 4.907167724907091 | -0.189 | 0.266 | 0.15 |
| 4.91030931756068 | -0.192 | 0.266 | 0.151 |
| 4.91345091021427 | -0.194 | 0.266 | 0.152 |
| 4.91659250286786 | -0.197 | 0.266 | 0.154 |
| 4.91973409552145 | -0.2 | 0.266 | 0.155 |
| 4.922875688175039 | -0.203 | 0.266 | 0.156 |
| 4.926017280828628 | -0.206 | 0.266 | 0.157 |
| 4.929158873482218 | -0.209 | 0.266 | 0.158 |
| 4.932300466135808 | -0.211 | 0.266 | 0.159 |
| 4.935442058789397 | -0.214 | 0.266 | 0.16 |
| 4.938583651442987 | -0.217 | 0.266 | 0.161 |
| 4.941725244096576 | -0.22 | 0.266 | 0.162 |
| 4.944866836750166 | -0.222 | 0.266 | 0.162 |
| 4.948008429403755 | -0.225 | 0.266 | 0.163 |
| 4.951150022057345 | -0.228 | 0.266 | 0.164 |
| 4.954291614710935 | -0.231 | 0.266 | 0.165 |
| 4.957433207364524 | -0.233 | 0.266 | 0.166 |
| 4.960574800018114 | -0.236 | 0.266 | 0.166 |
| 4.963716392671704 | -0.239 | 0.266 | 0.167 |
| 4.966857985325293 | -0.241 | 0.265 | 0.168 |
| 4.969999577978883 | -0.244 | 0.265 | 0.168 |
| 4.973141170632472 | -0.247 | 0.265 | 0.169 |
| 4.976282763286062 | -0.249 | 0.265 | 0.169 |
| 4.979424355939651 | -0.252 | 0.265 | 0.17 |
| 4.982565948593241 | -0.254 | 0.265 | 0.17 |
| 4.985707541246831 | -0.257 | 0.265 | 0.171 |
| 4.98884913390042 | -0.26 | 0.265 | 0.171 |
| 4.99199072655401 | -0.262 | 0.265 | 0.172 |
| 4.9951323192076 | -0.265 | 0.264 | 0.172 |
| 4.99827391186119 | -0.267 | 0.264 | 0.172 |
| 5.00141550451478 | -0.27 | 0.264 | 0.173 |
| 5.004557097168369 | -0.272 | 0.264 | 0.173 |
| 5.007698689821958 | -0.275 | 0.264 | 0.174 |
| 5.010840282475548 | -0.278 | 0.264 | 0.174 |
| 5.013981875129137 | -0.28 | 0.263 | 0.174 |
| 5.017123467782727 | -0.283 | 0.263 | 0.174 |
| 5.020265060436317 | -0.285 | 0.263 | 0.175 |
| 5.023406653089906 | -0.287 | 0.263 | 0.175 |
| 5.026548245743496 | -0.29 | 0.263 | 0.175 |
| 5.029689838397085 | -0.292 | 0.262 | 0.175 |
| 5.032831431050674 | -0.295 | 0.262 | 0.176 |
| 5.035973023704264 | -0.297 | 0.262 | 0.176 |
| 5.039114616357854 | -0.3 | 0.262 | 0.176 |
| 5.042256209011444 | -0.302 | 0.261 | 0.176 |
| 5.045397801665033 | -0.304 | 0.261 | 0.176 |
| 5.048539394318622 | -0.307 | 0.261 | 0.176 |
| 5.051680986972213 | -0.309 | 0.261 | 0.176 |
| 5.054822579625802 | -0.311 | 0.26 | 0.177 |
| 5.057964172279392 | -0.314 | 0.26 | 0.177 |
| 5.061105764932981 | -0.316 | 0.26 | 0.177 |
| 5.064247357586571 | -0.318 | 0.259 | 0.177 |
| 5.067388950240161 | -0.321 | 0.259 | 0.177 |
| 5.07053054289375 | -0.323 | 0.259 | 0.177 |
| 5.07367213554734 | -0.325 | 0.258 | 0.177 |
| 5.07681372820093 | -0.327 | 0.258 | 0.177 |
| 5.079955320854519 | -0.33 | 0.257 | 0.177 |
| 5.083096913508108 | -0.332 | 0.257 | 0.177 |
| 5.086238506161698 | -0.334 | 0.256 | 0.177 |
| 5.089380098815288 | -0.336 | 0.256 | 0.177 |
| 5.092521691468877 | -0.338 | 0.255 | 0.177 |
| 5.095663284122466 | -0.341 | 0.255 | 0.178 |
| 5.098804876776057 | -0.343 | 0.254 | 0.178 |
| 5.101946469429646 | -0.345 | 0.254 | 0.178 |
| 5.105088062083236 | -0.347 | 0.253 | 0.178 |
| 5.108229654736825 | -0.349 | 0.253 | 0.178 |
| 5.111371247390415 | -0.351 | 0.252 | 0.178 |
| 5.114512840044005 | -0.353 | 0.252 | 0.178 |
| 5.117654432697594 | -0.355 | 0.251 | 0.178 |
| 5.120796025351184 | -0.357 | 0.25 | 0.178 |
| 5.123937618004773 | -0.359 | 0.25 | 0.178 |
| 5.127079210658363 | -0.361 | 0.249 | 0.178 |
| 5.130220803311953 | -0.363 | 0.248 | 0.178 |
| 5.133362395965542 | -0.365 | 0.248 | 0.178 |
| 5.136503988619131 | -0.367 | 0.247 | 0.178 |
| 5.13964558127272 | -0.369 | 0.246 | 0.178 |
| 5.142787173926311 | -0.371 | 0.245 | 0.178 |
| 5.1459287665799 | -0.373 | 0.245 | 0.178 |
| 5.14907035923349 | -0.375 | 0.244 | 0.178 |
| 5.15221195188708 | -0.377 | 0.243 | 0.178 |
| 5.15535354454067 | -0.379 | 0.242 | 0.178 |
| 5.158495137194259 | -0.381 | 0.241 | 0.178 |
| 5.161636729847848 | -0.383 | 0.24 | 0.178 |
| 5.164778322501438 | -0.385 | 0.239 | 0.178 |
| 5.167919915155028 | -0.386 | 0.238 | 0.178 |
| 5.171061507808617 | -0.388 | 0.237 | 0.178 |
| 5.174203100462206 | -0.39 | 0.236 | 0.178 |
| 5.177344693115796 | -0.392 | 0.235 | 0.178 |
| 5.180486285769386 | -0.394 | 0.234 | 0.178 |
| 5.183627878422976 | -0.395 | 0.233 | 0.178 |
| 5.186769471076565 | -0.397 | 0.232 | 0.178 |
| 5.189911063730155 | -0.399 | 0.231 | 0.178 |
| 5.193052656383744 | -0.401 | 0.23 | 0.178 |
| 5.196194249037334 | -0.402 | 0.229 | 0.178 |
| 5.199335841690924 | -0.404 | 0.227 | 0.178 |
| 5.202477434344513 | -0.406 | 0.226 | 0.178 |
| 5.205619026998103 | -0.407 | 0.225 | 0.178 |
| 5.208760619651692 | -0.409 | 0.224 | 0.178 |
| 5.211902212305282 | -0.411 | 0.222 | 0.178 |
| 5.215043804958871 | -0.412 | 0.221 | 0.178 |
| 5.218185397612461 | -0.414 | 0.22 | 0.178 |
| 5.221326990266051 | -0.416 | 0.218 | 0.178 |
| 5.22446858291964 | -0.417 | 0.217 | 0.178 |
| 5.22761017557323 | -0.419 | 0.215 | 0.178 |
| 5.23075176822682 | -0.42 | 0.214 | 0.178 |
| 5.23389336088041 | -0.422 | 0.212 | 0.178 |
| 5.237034953533999 | -0.423 | 0.211 | 0.178 |
| 5.240176546187588 | -0.425 | 0.209 | 0.178 |
| 5.243318138841178 | -0.426 | 0.208 | 0.178 |
| 5.246459731494767 | -0.428 | 0.206 | 0.178 |
| 5.249601324148357 | -0.429 | 0.205 | 0.178 |
| 5.252742916801947 | -0.431 | 0.203 | 0.178 |
| 5.255884509455536 | -0.432 | 0.201 | 0.178 |
| 5.259026102109125 | -0.434 | 0.199 | 0.178 |
| 5.262167694762715 | -0.435 | 0.198 | 0.178 |
| 5.265309287416305 | -0.437 | 0.196 | 0.178 |
| 5.268450880069895 | -0.438 | 0.194 | 0.178 |
| 5.271592472723484 | -0.439 | 0.192 | 0.178 |
| 5.274734065377074 | -0.441 | 0.19 | 0.178 |
| 5.277875658030664 | -0.442 | 0.189 | 0.178 |
| 5.281017250684253 | -0.443 | 0.187 | 0.178 |
| 5.284158843337843 | -0.445 | 0.185 | 0.178 |
| 5.287300435991432 | -0.446 | 0.183 | 0.178 |
| 5.290442028645022 | -0.447 | 0.181 | 0.178 |
| 5.293583621298612 | -0.449 | 0.179 | 0.178 |
| 5.296725213952201 | -0.45 | 0.177 | 0.178 |
| 5.299866806605791 | -0.451 | 0.175 | 0.178 |
| 5.30300839925938 | -0.452 | 0.172 | 0.178 |
| 5.30614999191297 | -0.454 | 0.17 | 0.178 |
| 5.30929158456656 | -0.455 | 0.168 | 0.178 |
| 5.312433177220149 | -0.456 | 0.166 | 0.178 |
| 5.315574769873739 | -0.457 | 0.164 | 0.178 |
| 5.318716362527328 | -0.459 | 0.161 | 0.178 |
| 5.321857955180918 | -0.46 | 0.159 | 0.178 |
| 5.324999547834508 | -0.461 | 0.157 | 0.178 |
| 5.328141140488097 | -0.462 | 0.155 | 0.178 |
| 5.331282733141686 | -0.463 | 0.152 | 0.178 |
| 5.334424325795276 | -0.464 | 0.15 | 0.178 |
| 5.337565918448866 | -0.465 | 0.147 | 0.178 |
| 5.340707511102456 | -0.466 | 0.145 | 0.178 |
| 5.343849103756045 | -0.468 | 0.142 | 0.178 |
| 5.346990696409634 | -0.469 | 0.14 | 0.178 |
| 5.350132289063224 | -0.47 | 0.138 | 0.178 |
| 5.353273881716814 | -0.471 | 0.135 | 0.178 |
| 5.356415474370403 | -0.472 | 0.132 | 0.178 |
| 5.359557067023993 | -0.473 | 0.13 | 0.178 |
| 5.362698659677583 | -0.474 | 0.127 | 0.178 |
| 5.365840252331172 | -0.475 | 0.125 | 0.178 |
| 5.368981844984762 | -0.476 | 0.122 | 0.178 |
| 5.372123437638351 | -0.477 | 0.119 | 0.178 |
| 5.375265030291941 | -0.478 | 0.117 | 0.178 |
| 5.378406622945531 | -0.479 | 0.114 | 0.177 |
| 5.38154821559912 | -0.48 | 0.111 | 0.177 |
| 5.38468980825271 | -0.48 | 0.108 | 0.177 |
| 5.387831400906299 | -0.481 | 0.106 | 0.177 |
| 5.39097299355989 | -0.482 | 0.103 | 0.177 |
| 5.394114586213479 | -0.483 | 0.1 | 0.177 |
| 5.397256178867068 | -0.484 | 0.097 | 0.177 |
| 5.400397771520657 | -0.485 | 0.094 | 0.177 |
| 5.403539364174247 | -0.486 | 0.092 | 0.177 |
| 5.406680956827837 | -0.487 | 0.089 | 0.177 |
| 5.409822549481426 | -0.487 | 0.086 | 0.177 |
| 5.412964142135016 | -0.488 | 0.083 | 0.177 |
| 5.416105734788605 | -0.489 | 0.08 | 0.177 |
| 5.419247327442195 | -0.49 | 0.077 | 0.177 |
| 5.422388920095785 | -0.491 | 0.074 | 0.176 |
| 5.425530512749375 | -0.492 | 0.071 | 0.176 |
| 5.428672105402964 | -0.492 | 0.068 | 0.176 |
| 5.431813698056554 | -0.493 | 0.065 | 0.176 |
| 5.434955290710143 | -0.494 | 0.062 | 0.176 |
| 5.438096883363733 | -0.495 | 0.059 | 0.176 |
| 5.441238476017322 | -0.495 | 0.056 | 0.175 |
| 5.444380068670912 | -0.496 | 0.053 | 0.175 |
| 5.447521661324502 | -0.497 | 0.05 | 0.175 |
| 5.450663253978091 | -0.497 | 0.047 | 0.175 |
| 5.453804846631681 | -0.498 | 0.044 | 0.174 |
| 5.456946439285271 | -0.499 | 0.041 | 0.174 |
| 5.46008803193886 | -0.499 | 0.038 | 0.174 |
| 5.46322962459245 | -0.5 | 0.034 | 0.174 |
| 5.466371217246039 | -0.501 | 0.031 | 0.173 |
| 5.46951280989963 | -0.501 | 0.028 | 0.173 |
| 5.472654402553218 | -0.502 | 0.025 | 0.173 |
| 5.475795995206808 | -0.503 | 0.022 | 0.172 |
| 5.478937587860398 | -0.503 | 0.019 | 0.172 |
| 5.482079180513987 | -0.504 | 0.016 | 0.171 |
| 5.485220773167577 | -0.504 | 0.013 | 0.171 |
| 5.488362365821166 | -0.505 | 0.009 | 0.17 |
| 5.491503958474756 | -0.506 | 0.006 | 0.17 |
| 5.494645551128346 | -0.506 | 0.003 | 0.169 |
| 5.497787143781935 | -0.507 | 0 | 0.169 |
| 5.500928736435525 | -0.507 | -0.003 | 0.168 |
| 5.504070329089115 | -0.508 | -0.006 | 0.168 |
| 5.507211921742704 | -0.508 | -0.009 | 0.167 |
| 5.510353514396294 | -0.509 | -0.013 | 0.166 |
| 5.513495107049883 | -0.509 | -0.016 | 0.166 |
| 5.516636699703473 | -0.51 | -0.019 | 0.165 |
| 5.519778292357062 | -0.51 | -0.022 | 0.164 |
| 5.522919885010652 | -0.511 | -0.025 | 0.164 |
| 5.526061477664242 | -0.511 | -0.028 | 0.163 |
| 5.529203070317831 | -0.512 | -0.031 | 0.162 |
| 5.532344662971421 | -0.512 | -0.034 | 0.161 |
| 5.535486255625011 | -0.513 | -0.038 | 0.16 |
| 5.5386278482786 | -0.513 | -0.041 | 0.159 |
| 5.54176944093219 | -0.514 | -0.044 | 0.158 |
| 5.544911033585779 | -0.514 | -0.047 | 0.157 |
| 5.54805262623937 | -0.515 | -0.05 | 0.156 |
| 5.551194218892959 | -0.515 | -0.053 | 0.155 |
| 5.554335811546548 | -0.515 | -0.056 | 0.154 |
| 5.557477404200137 | -0.516 | -0.059 | 0.153 |
| 5.560618996853727 | -0.516 | -0.062 | 0.152 |
| 5.563760589507317 | -0.517 | -0.065 | 0.15 |
| 5.566902182160906 | -0.517 | -0.068 | 0.149 |
| 5.570043774814496 | -0.517 | -0.071 | 0.148 |
| 5.573185367468086 | -0.518 | -0.074 | 0.146 |
| 5.576326960121675 | -0.518 | -0.077 | 0.145 |
| 5.579468552775264 | -0.518 | -0.08 | 0.144 |
| 5.582610145428854 | -0.519 | -0.083 | 0.142 |
| 5.585751738082444 | -0.519 | -0.086 | 0.141 |
| 5.588893330736034 | -0.52 | -0.089 | 0.139 |
| 5.592034923389623 | -0.52 | -0.092 | 0.137 |
| 5.595176516043213 | -0.52 | -0.094 | 0.136 |
| 5.598318108696803 | -0.521 | -0.097 | 0.134 |
| 5.601459701350392 | -0.521 | -0.1 | 0.132 |
| 5.604601294003982 | -0.521 | -0.103 | 0.131 |
| 5.607742886657571 | -0.521 | -0.106 | 0.129 |
| 5.610884479311161 | -0.522 | -0.108 | 0.127 |
| 5.61402607196475 | -0.522 | -0.111 | 0.125 |
| 5.61716766461834 | -0.522 | -0.114 | 0.123 |
| 5.62030925727193 | -0.523 | -0.117 | 0.121 |
| 5.623450849925519 | -0.523 | -0.119 | 0.119 |
| 5.626592442579109 | -0.523 | -0.122 | 0.117 |
| 5.629734035232698 | -0.523 | -0.125 | 0.115 |
| 5.632875627886288 | -0.524 | -0.127 | 0.113 |
| 5.636017220539878 | -0.524 | -0.13 | 0.111 |
| 5.639158813193467 | -0.524 | -0.132 | 0.108 |
| 5.642300405847057 | -0.524 | -0.135 | 0.106 |
| 5.645441998500646 | -0.525 | -0.138 | 0.104 |
| 5.648583591154236 | -0.525 | -0.14 | 0.101 |
| 5.651725183807825 | -0.525 | -0.142 | 0.099 |
| 5.654866776461415 | -0.525 | -0.145 | 0.097 |
| 5.658008369115005 | -0.526 | -0.147 | 0.094 |
| 5.661149961768594 | -0.526 | -0.15 | 0.092 |
| 5.664291554422184 | -0.526 | -0.152 | 0.089 |
| 5.667433147075774 | -0.526 | -0.155 | 0.087 |
| 5.670574739729363 | -0.526 | -0.157 | 0.084 |
| 5.673716332382953 | -0.527 | -0.159 | 0.081 |
| 5.676857925036542 | -0.527 | -0.161 | 0.079 |
| 5.679999517690132 | -0.527 | -0.164 | 0.076 |
| 5.683141110343721 | -0.527 | -0.166 | 0.073 |
| 5.686282702997311 | -0.527 | -0.168 | 0.07 |
| 5.689424295650901 | -0.527 | -0.17 | 0.068 |
| 5.69256588830449 | -0.528 | -0.172 | 0.065 |
| 5.69570748095808 | -0.528 | -0.175 | 0.062 |
| 5.69884907361167 | -0.528 | -0.177 | 0.059 |
| 5.701990666265259 | -0.528 | -0.179 | 0.056 |
| 5.705132258918849 | -0.528 | -0.181 | 0.053 |
| 5.708273851572438 | -0.528 | -0.183 | 0.05 |
| 5.711415444226028 | -0.529 | -0.185 | 0.047 |
| 5.714557036879618 | -0.529 | -0.187 | 0.044 |
| 5.717698629533207 | -0.529 | -0.189 | 0.041 |
| 5.720840222186797 | -0.529 | -0.19 | 0.038 |
| 5.723981814840386 | -0.529 | -0.192 | 0.035 |
| 5.727123407493976 | -0.529 | -0.194 | 0.032 |
| 5.730265000147565 | -0.529 | -0.196 | 0.029 |
| 5.733406592801155 | -0.53 | -0.198 | 0.026 |
| 5.736548185454744 | -0.53 | -0.199 | 0.023 |
| 5.739689778108334 | -0.53 | -0.201 | 0.02 |
| 5.742831370761924 | -0.53 | -0.203 | 0.017 |
| 5.745972963415514 | -0.53 | -0.205 | 0.014 |
| 5.749114556069103 | -0.53 | -0.206 | 0.01 |
| 5.752256148722693 | -0.53 | -0.208 | 0.007 |
| 5.755397741376282 | -0.53 | -0.209 | 0.004 |
| 5.758539334029872 | -0.53 | -0.211 | 0.001 |
| 5.761680926683462 | -0.531 | -0.212 | -0.002 |
| 5.764822519337051 | -0.531 | -0.214 | -0.005 |
| 5.767964111990641 | -0.531 | -0.215 | -0.008 |
| 5.77110570464423 | -0.531 | -0.217 | -0.012 |
| 5.77424729729782 | -0.531 | -0.218 | -0.015 |
| 5.77738888995141 | -0.531 | -0.22 | -0.018 |
| 5.780530482605 | -0.531 | -0.221 | -0.021 |
| 5.783672075258588 | -0.531 | -0.222 | -0.024 |
| 5.786813667912178 | -0.531 | -0.224 | -0.027 |
| 5.789955260565768 | -0.531 | -0.225 | -0.03 |
| 5.793096853219358 | -0.531 | -0.226 | -0.033 |
| 5.796238445872947 | -0.531 | -0.227 | -0.036 |
| 5.799380038526537 | -0.531 | -0.229 | -0.039 |
| 5.802521631180126 | -0.532 | -0.23 | -0.042 |
| 5.805663223833715 | -0.532 | -0.231 | -0.045 |
| 5.808804816487306 | -0.532 | -0.232 | -0.048 |
| 5.811946409140895 | -0.532 | -0.233 | -0.051 |
| 5.815088001794485 | -0.532 | -0.234 | -0.054 |
| 5.818229594448074 | -0.532 | -0.235 | -0.057 |
| 5.821371187101663 | -0.532 | -0.236 | -0.06 |
| 5.824512779755254 | -0.532 | -0.237 | -0.063 |
| 5.827654372408843 | -0.532 | -0.238 | -0.066 |
| 5.830795965062433 | -0.532 | -0.239 | -0.069 |
| 5.833937557716022 | -0.532 | -0.24 | -0.071 |
| 5.837079150369612 | -0.532 | -0.241 | -0.074 |
| 5.840220743023201 | -0.532 | -0.242 | -0.077 |
| 5.843362335676791 | -0.532 | -0.243 | -0.08 |
| 5.846503928330381 | -0.532 | -0.244 | -0.082 |
| 5.84964552098397 | -0.532 | -0.245 | -0.085 |
| 5.85278711363756 | -0.532 | -0.245 | -0.087 |
| 5.85592870629115 | -0.532 | -0.246 | -0.09 |
| 5.85907029894474 | -0.532 | -0.247 | -0.093 |
| 5.862211891598329 | -0.533 | -0.248 | -0.095 |
| 5.865353484251918 | -0.533 | -0.248 | -0.097 |
| 5.868495076905508 | -0.533 | -0.249 | -0.1 |
| 5.871636669559098 | -0.533 | -0.25 | -0.102 |
| 5.874778262212687 | -0.533 | -0.25 | -0.105 |
| 5.877919854866277 | -0.533 | -0.251 | -0.107 |
| 5.881061447519866 | -0.533 | -0.252 | -0.109 |
| 5.884203040173456 | -0.533 | -0.252 | -0.111 |
| 5.887344632827046 | -0.533 | -0.253 | -0.114 |
| 5.890486225480635 | -0.533 | -0.253 | -0.116 |
| 5.893627818134224 | -0.533 | -0.254 | -0.118 |
| 5.896769410787814 | -0.533 | -0.254 | -0.12 |
| 5.899911003441404 | -0.533 | -0.255 | -0.122 |
| 5.903052596094994 | -0.533 | -0.255 | -0.124 |
| 5.906194188748583 | -0.533 | -0.256 | -0.126 |
| 5.909335781402172 | -0.533 | -0.256 | -0.128 |
| 5.912477374055762 | -0.533 | -0.257 | -0.129 |
| 5.915618966709352 | -0.533 | -0.257 | -0.131 |
| 5.918760559362942 | -0.533 | -0.258 | -0.133 |
| 5.921902152016531 | -0.533 | -0.258 | -0.135 |
| 5.92504374467012 | -0.533 | -0.259 | -0.136 |
| 5.92818533732371 | -0.533 | -0.259 | -0.138 |
| 5.9313269299773 | -0.533 | -0.259 | -0.14 |
| 5.93446852263089 | -0.533 | -0.26 | -0.141 |
| 5.93761011528448 | -0.533 | -0.26 | -0.143 |
| 5.940751707938068 | -0.533 | -0.26 | -0.144 |
| 5.943893300591658 | -0.533 | -0.261 | -0.146 |
| 5.947034893245248 | -0.533 | -0.261 | -0.147 |
| 5.950176485898837 | -0.533 | -0.261 | -0.148 |
| 5.953318078552427 | -0.533 | -0.261 | -0.15 |
| 5.956459671206017 | -0.533 | -0.262 | -0.151 |
| 5.959601263859606 | -0.533 | -0.262 | -0.152 |
| 5.962742856513196 | -0.533 | -0.262 | -0.153 |
| 5.965884449166785 | -0.533 | -0.262 | -0.154 |
| 5.969026041820375 | -0.533 | -0.263 | -0.155 |
| 5.972167634473964 | -0.533 | -0.263 | -0.157 |
| 5.975309227127554 | -0.533 | -0.263 | -0.158 |
| 5.978450819781144 | -0.533 | -0.263 | -0.159 |
| 5.981592412434733 | -0.533 | -0.263 | -0.16 |
| 5.984734005088323 | -0.533 | -0.264 | -0.16 |
| 5.987875597741913 | -0.533 | -0.264 | -0.161 |
| 5.991017190395502 | -0.533 | -0.264 | -0.162 |
| 5.994158783049092 | -0.533 | -0.264 | -0.163 |
| 5.997300375702681 | -0.533 | -0.264 | -0.164 |
| 6.000441968356271 | -0.533 | -0.264 | -0.165 |
| 6.003583561009861 | -0.533 | -0.265 | -0.165 |
| 6.00672515366345 | -0.533 | -0.265 | -0.166 |
| 6.00986674631704 | -0.533 | -0.265 | -0.167 |
| 6.01300833897063 | -0.533 | -0.265 | -0.167 |
| 6.01614993162422 | -0.533 | -0.265 | -0.168 |
| 6.019291524277808 | -0.533 | -0.265 | -0.169 |
| 6.022433116931398 | -0.533 | -0.265 | -0.169 |
| 6.025574709584988 | -0.533 | -0.265 | -0.17 |
| 6.028716302238577 | -0.533 | -0.265 | -0.17 |
| 6.031857894892167 | -0.533 | -0.266 | -0.171 |
| 6.034999487545757 | -0.533 | -0.266 | -0.171 |
| 6.038141080199346 | -0.533 | -0.266 | -0.172 |
| 6.041282672852935 | -0.533 | -0.266 | -0.172 |
| 6.044424265506525 | -0.533 | -0.266 | -0.172 |
| 6.047565858160115 | -0.533 | -0.266 | -0.173 |
| 6.050707450813704 | -0.533 | -0.266 | -0.173 |
| 6.053849043467294 | -0.533 | -0.266 | -0.173 |
| 6.056990636120884 | -0.533 | -0.266 | -0.174 |
| 6.060132228774473 | -0.533 | -0.266 | -0.174 |
| 6.063273821428063 | -0.533 | -0.266 | -0.174 |
| 6.066415414081653 | -0.533 | -0.266 | -0.175 |
| 6.069557006735242 | -0.533 | -0.266 | -0.175 |
| 6.072698599388831 | -0.533 | -0.266 | -0.175 |
| 6.07584019204242 | -0.533 | -0.266 | -0.175 |
| 6.078981784696011 | -0.533 | -0.266 | -0.175 |
| 6.082123377349601 | -0.533 | -0.266 | -0.176 |
| 6.08526497000319 | -0.533 | -0.266 | -0.176 |
| 6.08840656265678 | -0.533 | -0.266 | -0.176 |
| 6.09154815531037 | -0.533 | -0.266 | -0.176 |
| 6.094689747963959 | -0.533 | -0.266 | -0.176 |
| 6.097831340617549 | -0.533 | -0.266 | -0.176 |
| 6.100972933271138 | -0.533 | -0.266 | -0.177 |
| 6.104114525924728 | -0.533 | -0.267 | -0.177 |
| 6.107256118578317 | -0.533 | -0.267 | -0.177 |
| 6.110397711231907 | -0.533 | -0.267 | -0.177 |
| 6.113539303885497 | -0.533 | -0.267 | -0.177 |
| 6.116680896539086 | -0.533 | -0.267 | -0.177 |
| 6.119822489192675 | -0.533 | -0.267 | -0.177 |
| 6.122964081846265 | -0.533 | -0.267 | -0.177 |
| 6.126105674499855 | -0.533 | -0.267 | -0.177 |
| 6.129247267153445 | -0.533 | -0.267 | -0.177 |
| 6.132388859807034 | -0.533 | -0.267 | -0.177 |
| 6.135530452460624 | -0.533 | -0.267 | -0.177 |
| 6.138672045114213 | -0.533 | -0.267 | -0.177 |
| 6.141813637767803 | -0.533 | -0.267 | -0.177 |
| 6.144955230421393 | -0.533 | -0.267 | -0.178 |
| 6.148096823074982 | -0.533 | -0.267 | -0.178 |
| 6.151238415728571 | -0.533 | -0.267 | -0.178 |
| 6.154380008382161 | -0.533 | -0.267 | -0.178 |
| 6.157521601035751 | -0.533 | -0.267 | -0.178 |
| 6.16066319368934 | -0.533 | -0.267 | -0.178 |
| 6.16380478634293 | -0.533 | -0.267 | -0.178 |
| 6.16694637899652 | -0.533 | -0.267 | -0.178 |
| 6.170087971650109 | -0.533 | -0.267 | -0.178 |
| 6.173229564303698 | -0.533 | -0.267 | -0.178 |
| 6.176371156957289 | -0.533 | -0.267 | -0.178 |
| 6.179512749610878 | -0.533 | -0.267 | -0.178 |
| 6.182654342264468 | -0.533 | -0.267 | -0.178 |
| 6.185795934918057 | -0.533 | -0.267 | -0.178 |
| 6.188937527571647 | -0.533 | -0.267 | -0.178 |
| 6.192079120225237 | -0.533 | -0.267 | -0.178 |
| 6.195220712878826 | -0.533 | -0.267 | -0.178 |
| 6.198362305532415 | -0.533 | -0.267 | -0.178 |
| 6.201503898186005 | -0.533 | -0.267 | -0.178 |
| 6.204645490839594 | -0.533 | -0.267 | -0.178 |
| 6.207787083493184 | -0.533 | -0.267 | -0.178 |
| 6.210928676146774 | -0.533 | -0.267 | -0.178 |
| 6.214070268800364 | -0.533 | -0.267 | -0.178 |
| 6.217211861453953 | -0.533 | -0.267 | -0.178 |
| 6.220353454107543 | -0.533 | -0.267 | -0.178 |
| 6.223495046761133 | -0.533 | -0.267 | -0.178 |
| 6.226636639414722 | -0.533 | -0.267 | -0.178 |
| 6.229778232068312 | -0.533 | -0.267 | -0.178 |
| 6.232919824721901 | -0.533 | -0.267 | -0.178 |
| 6.236061417375491 | -0.533 | -0.267 | -0.178 |
| 6.23920301002908 | -0.533 | -0.267 | -0.178 |
| 6.24234460268267 | -0.533 | -0.267 | -0.178 |
| 6.24548619533626 | -0.533 | -0.267 | -0.178 |
| 6.24862778798985 | -0.533 | -0.267 | -0.178 |
| 6.251769380643438 | -0.533 | -0.267 | -0.178 |
| 6.254910973297028 | -0.533 | -0.267 | -0.178 |
| 6.258052565950618 | -0.533 | -0.267 | -0.178 |
| 6.261194158604208 | -0.533 | -0.267 | -0.178 |
| 6.264335751257797 | -0.533 | -0.267 | -0.178 |
| 6.267477343911387 | -0.533 | -0.267 | -0.178 |
| 6.270618936564976 | -0.533 | -0.267 | -0.178 |
| 6.273760529218566 | -0.533 | -0.267 | -0.178 |
| 6.276902121872155 | -0.533 | -0.267 | -0.178 |
| 6.280043714525745 | -0.533 | -0.267 | -0.178 |
| 6.283185307179335 | -0.533 | -0.267 | -0.178 |